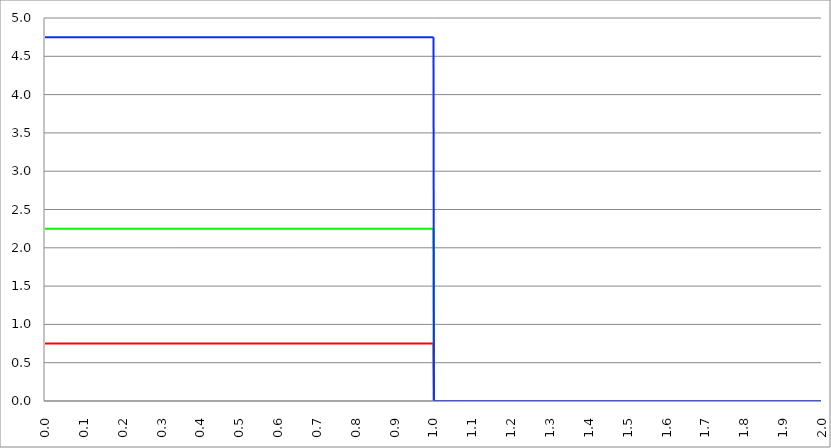
| Category | Series 1 | Series 0 | Series 2 |
|---|---|---|---|
| 0.0 | 0.75 | 2.25 | 4.75 |
| 0.001 | 0.75 | 2.25 | 4.75 |
| 0.002 | 0.75 | 2.25 | 4.75 |
| 0.003 | 0.75 | 2.25 | 4.75 |
| 0.004 | 0.75 | 2.25 | 4.75 |
| 0.005 | 0.75 | 2.25 | 4.75 |
| 0.006 | 0.75 | 2.25 | 4.75 |
| 0.007 | 0.75 | 2.25 | 4.75 |
| 0.008 | 0.75 | 2.25 | 4.75 |
| 0.009 | 0.75 | 2.25 | 4.75 |
| 0.01 | 0.75 | 2.25 | 4.75 |
| 0.011 | 0.75 | 2.25 | 4.75 |
| 0.012 | 0.75 | 2.25 | 4.75 |
| 0.013 | 0.75 | 2.25 | 4.75 |
| 0.014 | 0.75 | 2.25 | 4.75 |
| 0.015 | 0.75 | 2.25 | 4.75 |
| 0.016 | 0.75 | 2.25 | 4.75 |
| 0.017 | 0.75 | 2.25 | 4.75 |
| 0.018 | 0.75 | 2.25 | 4.75 |
| 0.019 | 0.75 | 2.25 | 4.75 |
| 0.02 | 0.75 | 2.25 | 4.75 |
| 0.021 | 0.75 | 2.25 | 4.75 |
| 0.022 | 0.75 | 2.25 | 4.75 |
| 0.023 | 0.75 | 2.25 | 4.75 |
| 0.024 | 0.75 | 2.25 | 4.75 |
| 0.025 | 0.75 | 2.25 | 4.75 |
| 0.026 | 0.75 | 2.25 | 4.75 |
| 0.027 | 0.75 | 2.25 | 4.75 |
| 0.028 | 0.75 | 2.25 | 4.75 |
| 0.029 | 0.75 | 2.25 | 4.75 |
| 0.03 | 0.75 | 2.25 | 4.75 |
| 0.031 | 0.75 | 2.25 | 4.75 |
| 0.032 | 0.75 | 2.25 | 4.75 |
| 0.033 | 0.75 | 2.25 | 4.75 |
| 0.034 | 0.75 | 2.25 | 4.75 |
| 0.035 | 0.75 | 2.25 | 4.75 |
| 0.036 | 0.75 | 2.25 | 4.75 |
| 0.037 | 0.75 | 2.25 | 4.75 |
| 0.038 | 0.75 | 2.25 | 4.75 |
| 0.039 | 0.75 | 2.25 | 4.75 |
| 0.04 | 0.75 | 2.25 | 4.75 |
| 0.041 | 0.75 | 2.25 | 4.75 |
| 0.042 | 0.75 | 2.25 | 4.75 |
| 0.043 | 0.75 | 2.25 | 4.75 |
| 0.044 | 0.75 | 2.25 | 4.75 |
| 0.045 | 0.75 | 2.25 | 4.75 |
| 0.046 | 0.75 | 2.25 | 4.75 |
| 0.047 | 0.75 | 2.25 | 4.75 |
| 0.048 | 0.75 | 2.25 | 4.75 |
| 0.049 | 0.75 | 2.25 | 4.75 |
| 0.05 | 0.75 | 2.25 | 4.75 |
| 0.051 | 0.75 | 2.25 | 4.75 |
| 0.052 | 0.75 | 2.25 | 4.75 |
| 0.053 | 0.75 | 2.25 | 4.75 |
| 0.054 | 0.75 | 2.25 | 4.75 |
| 0.055 | 0.75 | 2.25 | 4.75 |
| 0.056 | 0.75 | 2.25 | 4.75 |
| 0.057 | 0.75 | 2.25 | 4.75 |
| 0.058 | 0.75 | 2.25 | 4.75 |
| 0.059 | 0.75 | 2.25 | 4.75 |
| 0.06 | 0.75 | 2.25 | 4.75 |
| 0.061 | 0.75 | 2.25 | 4.75 |
| 0.062 | 0.75 | 2.25 | 4.75 |
| 0.063 | 0.75 | 2.25 | 4.75 |
| 0.064 | 0.75 | 2.25 | 4.75 |
| 0.065 | 0.75 | 2.25 | 4.75 |
| 0.066 | 0.75 | 2.25 | 4.75 |
| 0.067 | 0.75 | 2.25 | 4.75 |
| 0.068 | 0.75 | 2.25 | 4.75 |
| 0.069 | 0.75 | 2.25 | 4.75 |
| 0.07 | 0.75 | 2.25 | 4.75 |
| 0.071 | 0.75 | 2.25 | 4.75 |
| 0.072 | 0.75 | 2.25 | 4.75 |
| 0.073 | 0.75 | 2.25 | 4.75 |
| 0.074 | 0.75 | 2.25 | 4.75 |
| 0.075 | 0.75 | 2.25 | 4.75 |
| 0.076 | 0.75 | 2.25 | 4.75 |
| 0.077 | 0.75 | 2.25 | 4.75 |
| 0.078 | 0.75 | 2.25 | 4.75 |
| 0.079 | 0.75 | 2.25 | 4.75 |
| 0.08 | 0.75 | 2.25 | 4.75 |
| 0.081 | 0.75 | 2.25 | 4.75 |
| 0.082 | 0.75 | 2.25 | 4.75 |
| 0.083 | 0.75 | 2.25 | 4.75 |
| 0.084 | 0.75 | 2.25 | 4.75 |
| 0.085 | 0.75 | 2.25 | 4.75 |
| 0.086 | 0.75 | 2.25 | 4.75 |
| 0.087 | 0.75 | 2.25 | 4.75 |
| 0.088 | 0.75 | 2.25 | 4.75 |
| 0.089 | 0.75 | 2.25 | 4.75 |
| 0.09 | 0.75 | 2.25 | 4.75 |
| 0.091 | 0.75 | 2.25 | 4.75 |
| 0.092 | 0.75 | 2.25 | 4.75 |
| 0.093 | 0.75 | 2.25 | 4.75 |
| 0.094 | 0.75 | 2.25 | 4.75 |
| 0.095 | 0.75 | 2.25 | 4.75 |
| 0.096 | 0.75 | 2.25 | 4.75 |
| 0.097 | 0.75 | 2.25 | 4.75 |
| 0.098 | 0.75 | 2.25 | 4.75 |
| 0.099 | 0.75 | 2.25 | 4.75 |
| 0.1 | 0.75 | 2.25 | 4.75 |
| 0.101 | 0.75 | 2.25 | 4.75 |
| 0.102 | 0.75 | 2.25 | 4.75 |
| 0.103 | 0.75 | 2.25 | 4.75 |
| 0.104 | 0.75 | 2.25 | 4.75 |
| 0.105 | 0.75 | 2.25 | 4.75 |
| 0.106 | 0.75 | 2.25 | 4.75 |
| 0.107 | 0.75 | 2.25 | 4.75 |
| 0.108 | 0.75 | 2.25 | 4.75 |
| 0.109 | 0.75 | 2.25 | 4.75 |
| 0.11 | 0.75 | 2.25 | 4.75 |
| 0.111 | 0.75 | 2.25 | 4.75 |
| 0.112 | 0.75 | 2.25 | 4.75 |
| 0.113 | 0.75 | 2.25 | 4.75 |
| 0.114 | 0.75 | 2.25 | 4.75 |
| 0.115 | 0.75 | 2.25 | 4.75 |
| 0.116 | 0.75 | 2.25 | 4.75 |
| 0.117 | 0.75 | 2.25 | 4.75 |
| 0.118 | 0.75 | 2.25 | 4.75 |
| 0.119 | 0.75 | 2.25 | 4.75 |
| 0.12 | 0.75 | 2.25 | 4.75 |
| 0.121 | 0.75 | 2.25 | 4.75 |
| 0.122 | 0.75 | 2.25 | 4.75 |
| 0.123 | 0.75 | 2.25 | 4.75 |
| 0.124 | 0.75 | 2.25 | 4.75 |
| 0.125 | 0.75 | 2.25 | 4.75 |
| 0.126 | 0.75 | 2.25 | 4.75 |
| 0.127 | 0.75 | 2.25 | 4.75 |
| 0.128 | 0.75 | 2.25 | 4.75 |
| 0.129 | 0.75 | 2.25 | 4.75 |
| 0.13 | 0.75 | 2.25 | 4.75 |
| 0.131 | 0.75 | 2.25 | 4.75 |
| 0.132 | 0.75 | 2.25 | 4.75 |
| 0.133 | 0.75 | 2.25 | 4.75 |
| 0.134 | 0.75 | 2.25 | 4.75 |
| 0.135 | 0.75 | 2.25 | 4.75 |
| 0.136 | 0.75 | 2.25 | 4.75 |
| 0.137 | 0.75 | 2.25 | 4.75 |
| 0.138 | 0.75 | 2.25 | 4.75 |
| 0.139 | 0.75 | 2.25 | 4.75 |
| 0.14 | 0.75 | 2.25 | 4.75 |
| 0.141 | 0.75 | 2.25 | 4.75 |
| 0.142 | 0.75 | 2.25 | 4.75 |
| 0.143 | 0.75 | 2.25 | 4.75 |
| 0.144 | 0.75 | 2.25 | 4.75 |
| 0.145 | 0.75 | 2.25 | 4.75 |
| 0.146 | 0.75 | 2.25 | 4.75 |
| 0.147 | 0.75 | 2.25 | 4.75 |
| 0.148 | 0.75 | 2.25 | 4.75 |
| 0.149 | 0.75 | 2.25 | 4.75 |
| 0.15 | 0.75 | 2.25 | 4.75 |
| 0.151 | 0.75 | 2.25 | 4.75 |
| 0.152 | 0.75 | 2.25 | 4.75 |
| 0.153 | 0.75 | 2.25 | 4.75 |
| 0.154 | 0.75 | 2.25 | 4.75 |
| 0.155 | 0.75 | 2.25 | 4.75 |
| 0.156 | 0.75 | 2.25 | 4.75 |
| 0.157 | 0.75 | 2.25 | 4.75 |
| 0.158 | 0.75 | 2.25 | 4.75 |
| 0.159 | 0.75 | 2.25 | 4.75 |
| 0.16 | 0.75 | 2.25 | 4.75 |
| 0.161 | 0.75 | 2.25 | 4.75 |
| 0.162 | 0.75 | 2.25 | 4.75 |
| 0.163 | 0.75 | 2.25 | 4.75 |
| 0.164 | 0.75 | 2.25 | 4.75 |
| 0.165 | 0.75 | 2.25 | 4.75 |
| 0.166 | 0.75 | 2.25 | 4.75 |
| 0.167 | 0.75 | 2.25 | 4.75 |
| 0.168 | 0.75 | 2.25 | 4.75 |
| 0.169 | 0.75 | 2.25 | 4.75 |
| 0.17 | 0.75 | 2.25 | 4.75 |
| 0.171 | 0.75 | 2.25 | 4.75 |
| 0.172 | 0.75 | 2.25 | 4.75 |
| 0.173 | 0.75 | 2.25 | 4.75 |
| 0.174 | 0.75 | 2.25 | 4.75 |
| 0.175 | 0.75 | 2.25 | 4.75 |
| 0.176 | 0.75 | 2.25 | 4.75 |
| 0.177 | 0.75 | 2.25 | 4.75 |
| 0.178 | 0.75 | 2.25 | 4.75 |
| 0.179 | 0.75 | 2.25 | 4.75 |
| 0.18 | 0.75 | 2.25 | 4.75 |
| 0.181 | 0.75 | 2.25 | 4.75 |
| 0.182 | 0.75 | 2.25 | 4.75 |
| 0.183 | 0.75 | 2.25 | 4.75 |
| 0.184 | 0.75 | 2.25 | 4.75 |
| 0.185 | 0.75 | 2.25 | 4.75 |
| 0.186 | 0.75 | 2.25 | 4.75 |
| 0.187 | 0.75 | 2.25 | 4.75 |
| 0.188 | 0.75 | 2.25 | 4.75 |
| 0.189 | 0.75 | 2.25 | 4.75 |
| 0.19 | 0.75 | 2.25 | 4.75 |
| 0.191 | 0.75 | 2.25 | 4.75 |
| 0.192 | 0.75 | 2.25 | 4.75 |
| 0.193 | 0.75 | 2.25 | 4.75 |
| 0.194 | 0.75 | 2.25 | 4.75 |
| 0.195 | 0.75 | 2.25 | 4.75 |
| 0.196 | 0.75 | 2.25 | 4.75 |
| 0.197 | 0.75 | 2.25 | 4.75 |
| 0.198 | 0.75 | 2.25 | 4.75 |
| 0.199 | 0.75 | 2.25 | 4.75 |
| 0.2 | 0.75 | 2.25 | 4.75 |
| 0.201 | 0.75 | 2.25 | 4.75 |
| 0.202 | 0.75 | 2.25 | 4.75 |
| 0.203 | 0.75 | 2.25 | 4.75 |
| 0.204 | 0.75 | 2.25 | 4.75 |
| 0.205 | 0.75 | 2.25 | 4.75 |
| 0.206 | 0.75 | 2.25 | 4.75 |
| 0.207 | 0.75 | 2.25 | 4.75 |
| 0.208 | 0.75 | 2.25 | 4.75 |
| 0.209 | 0.75 | 2.25 | 4.75 |
| 0.21 | 0.75 | 2.25 | 4.75 |
| 0.211 | 0.75 | 2.25 | 4.75 |
| 0.212 | 0.75 | 2.25 | 4.75 |
| 0.213 | 0.75 | 2.25 | 4.75 |
| 0.214 | 0.75 | 2.25 | 4.75 |
| 0.215 | 0.75 | 2.25 | 4.75 |
| 0.216 | 0.75 | 2.25 | 4.75 |
| 0.217 | 0.75 | 2.25 | 4.75 |
| 0.218 | 0.75 | 2.25 | 4.75 |
| 0.219 | 0.75 | 2.25 | 4.75 |
| 0.22 | 0.75 | 2.25 | 4.75 |
| 0.221 | 0.75 | 2.25 | 4.75 |
| 0.222 | 0.75 | 2.25 | 4.75 |
| 0.223 | 0.75 | 2.25 | 4.75 |
| 0.224 | 0.75 | 2.25 | 4.75 |
| 0.225 | 0.75 | 2.25 | 4.75 |
| 0.226 | 0.75 | 2.25 | 4.75 |
| 0.227 | 0.75 | 2.25 | 4.75 |
| 0.228 | 0.75 | 2.25 | 4.75 |
| 0.229 | 0.75 | 2.25 | 4.75 |
| 0.23 | 0.75 | 2.25 | 4.75 |
| 0.231 | 0.75 | 2.25 | 4.75 |
| 0.232 | 0.75 | 2.25 | 4.75 |
| 0.233 | 0.75 | 2.25 | 4.75 |
| 0.234 | 0.75 | 2.25 | 4.75 |
| 0.235 | 0.75 | 2.25 | 4.75 |
| 0.236 | 0.75 | 2.25 | 4.75 |
| 0.237 | 0.75 | 2.25 | 4.75 |
| 0.238 | 0.75 | 2.25 | 4.75 |
| 0.239 | 0.75 | 2.25 | 4.75 |
| 0.24 | 0.75 | 2.25 | 4.75 |
| 0.241 | 0.75 | 2.25 | 4.75 |
| 0.242 | 0.75 | 2.25 | 4.75 |
| 0.243 | 0.75 | 2.25 | 4.75 |
| 0.244 | 0.75 | 2.25 | 4.75 |
| 0.245 | 0.75 | 2.25 | 4.75 |
| 0.246 | 0.75 | 2.25 | 4.75 |
| 0.247 | 0.75 | 2.25 | 4.75 |
| 0.248 | 0.75 | 2.25 | 4.75 |
| 0.249 | 0.75 | 2.25 | 4.75 |
| 0.25 | 0.75 | 2.25 | 4.75 |
| 0.251 | 0.75 | 2.25 | 4.75 |
| 0.252 | 0.75 | 2.25 | 4.75 |
| 0.253 | 0.75 | 2.25 | 4.75 |
| 0.254 | 0.75 | 2.25 | 4.75 |
| 0.255 | 0.75 | 2.25 | 4.75 |
| 0.256 | 0.75 | 2.25 | 4.75 |
| 0.257 | 0.75 | 2.25 | 4.75 |
| 0.258 | 0.75 | 2.25 | 4.75 |
| 0.259 | 0.75 | 2.25 | 4.75 |
| 0.26 | 0.75 | 2.25 | 4.75 |
| 0.261 | 0.75 | 2.25 | 4.75 |
| 0.262 | 0.75 | 2.25 | 4.75 |
| 0.263 | 0.75 | 2.25 | 4.75 |
| 0.264 | 0.75 | 2.25 | 4.75 |
| 0.265 | 0.75 | 2.25 | 4.75 |
| 0.266 | 0.75 | 2.25 | 4.75 |
| 0.267 | 0.75 | 2.25 | 4.75 |
| 0.268 | 0.75 | 2.25 | 4.75 |
| 0.269 | 0.75 | 2.25 | 4.75 |
| 0.27 | 0.75 | 2.25 | 4.75 |
| 0.271 | 0.75 | 2.25 | 4.75 |
| 0.272 | 0.75 | 2.25 | 4.75 |
| 0.273 | 0.75 | 2.25 | 4.75 |
| 0.274 | 0.75 | 2.25 | 4.75 |
| 0.275 | 0.75 | 2.25 | 4.75 |
| 0.276 | 0.75 | 2.25 | 4.75 |
| 0.277 | 0.75 | 2.25 | 4.75 |
| 0.278 | 0.75 | 2.25 | 4.75 |
| 0.279 | 0.75 | 2.25 | 4.75 |
| 0.28 | 0.75 | 2.25 | 4.75 |
| 0.281 | 0.75 | 2.25 | 4.75 |
| 0.282 | 0.75 | 2.25 | 4.75 |
| 0.283 | 0.75 | 2.25 | 4.75 |
| 0.284 | 0.75 | 2.25 | 4.75 |
| 0.285 | 0.75 | 2.25 | 4.75 |
| 0.286 | 0.75 | 2.25 | 4.75 |
| 0.287 | 0.75 | 2.25 | 4.75 |
| 0.288 | 0.75 | 2.25 | 4.75 |
| 0.289 | 0.75 | 2.25 | 4.75 |
| 0.29 | 0.75 | 2.25 | 4.75 |
| 0.291 | 0.75 | 2.25 | 4.75 |
| 0.292 | 0.75 | 2.25 | 4.75 |
| 0.293 | 0.75 | 2.25 | 4.75 |
| 0.294 | 0.75 | 2.25 | 4.75 |
| 0.295 | 0.75 | 2.25 | 4.75 |
| 0.296 | 0.75 | 2.25 | 4.75 |
| 0.297 | 0.75 | 2.25 | 4.75 |
| 0.298 | 0.75 | 2.25 | 4.75 |
| 0.299 | 0.75 | 2.25 | 4.75 |
| 0.3 | 0.75 | 2.25 | 4.75 |
| 0.301 | 0.75 | 2.25 | 4.75 |
| 0.302 | 0.75 | 2.25 | 4.75 |
| 0.303 | 0.75 | 2.25 | 4.75 |
| 0.304 | 0.75 | 2.25 | 4.75 |
| 0.305 | 0.75 | 2.25 | 4.75 |
| 0.306 | 0.75 | 2.25 | 4.75 |
| 0.307 | 0.75 | 2.25 | 4.75 |
| 0.308 | 0.75 | 2.25 | 4.75 |
| 0.309 | 0.75 | 2.25 | 4.75 |
| 0.31 | 0.75 | 2.25 | 4.75 |
| 0.311 | 0.75 | 2.25 | 4.75 |
| 0.312 | 0.75 | 2.25 | 4.75 |
| 0.313 | 0.75 | 2.25 | 4.75 |
| 0.314 | 0.75 | 2.25 | 4.75 |
| 0.315 | 0.75 | 2.25 | 4.75 |
| 0.316 | 0.75 | 2.25 | 4.75 |
| 0.317 | 0.75 | 2.25 | 4.75 |
| 0.318 | 0.75 | 2.25 | 4.75 |
| 0.319 | 0.75 | 2.25 | 4.75 |
| 0.32 | 0.75 | 2.25 | 4.75 |
| 0.321 | 0.75 | 2.25 | 4.75 |
| 0.322 | 0.75 | 2.25 | 4.75 |
| 0.323 | 0.75 | 2.25 | 4.75 |
| 0.324 | 0.75 | 2.25 | 4.75 |
| 0.325 | 0.75 | 2.25 | 4.75 |
| 0.326 | 0.75 | 2.25 | 4.75 |
| 0.327 | 0.75 | 2.25 | 4.75 |
| 0.328 | 0.75 | 2.25 | 4.75 |
| 0.329 | 0.75 | 2.25 | 4.75 |
| 0.33 | 0.75 | 2.25 | 4.75 |
| 0.331 | 0.75 | 2.25 | 4.75 |
| 0.332 | 0.75 | 2.25 | 4.75 |
| 0.333 | 0.75 | 2.25 | 4.75 |
| 0.334 | 0.75 | 2.25 | 4.75 |
| 0.335 | 0.75 | 2.25 | 4.75 |
| 0.336 | 0.75 | 2.25 | 4.75 |
| 0.337 | 0.75 | 2.25 | 4.75 |
| 0.338 | 0.75 | 2.25 | 4.75 |
| 0.339 | 0.75 | 2.25 | 4.75 |
| 0.34 | 0.75 | 2.25 | 4.75 |
| 0.341 | 0.75 | 2.25 | 4.75 |
| 0.342 | 0.75 | 2.25 | 4.75 |
| 0.343 | 0.75 | 2.25 | 4.75 |
| 0.344 | 0.75 | 2.25 | 4.75 |
| 0.345 | 0.75 | 2.25 | 4.75 |
| 0.346 | 0.75 | 2.25 | 4.75 |
| 0.347 | 0.75 | 2.25 | 4.75 |
| 0.348 | 0.75 | 2.25 | 4.75 |
| 0.349 | 0.75 | 2.25 | 4.75 |
| 0.35 | 0.75 | 2.25 | 4.75 |
| 0.351 | 0.75 | 2.25 | 4.75 |
| 0.352 | 0.75 | 2.25 | 4.75 |
| 0.353 | 0.75 | 2.25 | 4.75 |
| 0.354 | 0.75 | 2.25 | 4.75 |
| 0.355 | 0.75 | 2.25 | 4.75 |
| 0.356 | 0.75 | 2.25 | 4.75 |
| 0.357 | 0.75 | 2.25 | 4.75 |
| 0.358 | 0.75 | 2.25 | 4.75 |
| 0.359 | 0.75 | 2.25 | 4.75 |
| 0.36 | 0.75 | 2.25 | 4.75 |
| 0.361 | 0.75 | 2.25 | 4.75 |
| 0.362 | 0.75 | 2.25 | 4.75 |
| 0.363 | 0.75 | 2.25 | 4.75 |
| 0.364 | 0.75 | 2.25 | 4.75 |
| 0.365 | 0.75 | 2.25 | 4.75 |
| 0.366 | 0.75 | 2.25 | 4.75 |
| 0.367 | 0.75 | 2.25 | 4.75 |
| 0.368 | 0.75 | 2.25 | 4.75 |
| 0.369 | 0.75 | 2.25 | 4.75 |
| 0.37 | 0.75 | 2.25 | 4.75 |
| 0.371 | 0.75 | 2.25 | 4.75 |
| 0.372 | 0.75 | 2.25 | 4.75 |
| 0.373 | 0.75 | 2.25 | 4.75 |
| 0.374 | 0.75 | 2.25 | 4.75 |
| 0.375 | 0.75 | 2.25 | 4.75 |
| 0.376 | 0.75 | 2.25 | 4.75 |
| 0.377 | 0.75 | 2.25 | 4.75 |
| 0.378 | 0.75 | 2.25 | 4.75 |
| 0.379 | 0.75 | 2.25 | 4.75 |
| 0.38 | 0.75 | 2.25 | 4.75 |
| 0.381 | 0.75 | 2.25 | 4.75 |
| 0.382 | 0.75 | 2.25 | 4.75 |
| 0.383 | 0.75 | 2.25 | 4.75 |
| 0.384 | 0.75 | 2.25 | 4.75 |
| 0.385 | 0.75 | 2.25 | 4.75 |
| 0.386 | 0.75 | 2.25 | 4.75 |
| 0.387 | 0.75 | 2.25 | 4.75 |
| 0.388 | 0.75 | 2.25 | 4.75 |
| 0.389 | 0.75 | 2.25 | 4.75 |
| 0.39 | 0.75 | 2.25 | 4.75 |
| 0.391 | 0.75 | 2.25 | 4.75 |
| 0.392 | 0.75 | 2.25 | 4.75 |
| 0.393 | 0.75 | 2.25 | 4.75 |
| 0.394 | 0.75 | 2.25 | 4.75 |
| 0.395 | 0.75 | 2.25 | 4.75 |
| 0.396 | 0.75 | 2.25 | 4.75 |
| 0.397 | 0.75 | 2.25 | 4.75 |
| 0.398 | 0.75 | 2.25 | 4.75 |
| 0.399 | 0.75 | 2.25 | 4.75 |
| 0.4 | 0.75 | 2.25 | 4.75 |
| 0.401 | 0.75 | 2.25 | 4.75 |
| 0.402 | 0.75 | 2.25 | 4.75 |
| 0.403 | 0.75 | 2.25 | 4.75 |
| 0.404 | 0.75 | 2.25 | 4.75 |
| 0.405 | 0.75 | 2.25 | 4.75 |
| 0.406 | 0.75 | 2.25 | 4.75 |
| 0.407 | 0.75 | 2.25 | 4.75 |
| 0.408 | 0.75 | 2.25 | 4.75 |
| 0.409 | 0.75 | 2.25 | 4.75 |
| 0.41 | 0.75 | 2.25 | 4.75 |
| 0.411 | 0.75 | 2.25 | 4.75 |
| 0.412 | 0.75 | 2.25 | 4.75 |
| 0.413 | 0.75 | 2.25 | 4.75 |
| 0.414 | 0.75 | 2.25 | 4.75 |
| 0.415 | 0.75 | 2.25 | 4.75 |
| 0.416 | 0.75 | 2.25 | 4.75 |
| 0.417 | 0.75 | 2.25 | 4.75 |
| 0.418 | 0.75 | 2.25 | 4.75 |
| 0.419 | 0.75 | 2.25 | 4.75 |
| 0.42 | 0.75 | 2.25 | 4.75 |
| 0.421 | 0.75 | 2.25 | 4.75 |
| 0.422 | 0.75 | 2.25 | 4.75 |
| 0.423 | 0.75 | 2.25 | 4.75 |
| 0.424 | 0.75 | 2.25 | 4.75 |
| 0.425 | 0.75 | 2.25 | 4.75 |
| 0.426 | 0.75 | 2.25 | 4.75 |
| 0.427 | 0.75 | 2.25 | 4.75 |
| 0.428 | 0.75 | 2.25 | 4.75 |
| 0.429 | 0.75 | 2.25 | 4.75 |
| 0.43 | 0.75 | 2.25 | 4.75 |
| 0.431 | 0.75 | 2.25 | 4.75 |
| 0.432 | 0.75 | 2.25 | 4.75 |
| 0.433 | 0.75 | 2.25 | 4.75 |
| 0.434 | 0.75 | 2.25 | 4.75 |
| 0.435 | 0.75 | 2.25 | 4.75 |
| 0.436 | 0.75 | 2.25 | 4.75 |
| 0.437 | 0.75 | 2.25 | 4.75 |
| 0.438 | 0.75 | 2.25 | 4.75 |
| 0.439 | 0.75 | 2.25 | 4.75 |
| 0.44 | 0.75 | 2.25 | 4.75 |
| 0.441 | 0.75 | 2.25 | 4.75 |
| 0.442 | 0.75 | 2.25 | 4.75 |
| 0.443 | 0.75 | 2.25 | 4.75 |
| 0.444 | 0.75 | 2.25 | 4.75 |
| 0.445 | 0.75 | 2.25 | 4.75 |
| 0.446 | 0.75 | 2.25 | 4.75 |
| 0.447 | 0.75 | 2.25 | 4.75 |
| 0.448 | 0.75 | 2.25 | 4.75 |
| 0.449 | 0.75 | 2.25 | 4.75 |
| 0.45 | 0.75 | 2.25 | 4.75 |
| 0.451 | 0.75 | 2.25 | 4.75 |
| 0.452 | 0.75 | 2.25 | 4.75 |
| 0.453 | 0.75 | 2.25 | 4.75 |
| 0.454 | 0.75 | 2.25 | 4.75 |
| 0.455 | 0.75 | 2.25 | 4.75 |
| 0.456 | 0.75 | 2.25 | 4.75 |
| 0.457 | 0.75 | 2.25 | 4.75 |
| 0.458 | 0.75 | 2.25 | 4.75 |
| 0.459 | 0.75 | 2.25 | 4.75 |
| 0.46 | 0.75 | 2.25 | 4.75 |
| 0.461 | 0.75 | 2.25 | 4.75 |
| 0.462 | 0.75 | 2.25 | 4.75 |
| 0.463 | 0.75 | 2.25 | 4.75 |
| 0.464 | 0.75 | 2.25 | 4.75 |
| 0.465 | 0.75 | 2.25 | 4.75 |
| 0.466 | 0.75 | 2.25 | 4.75 |
| 0.467 | 0.75 | 2.25 | 4.75 |
| 0.468 | 0.75 | 2.25 | 4.75 |
| 0.469 | 0.75 | 2.25 | 4.75 |
| 0.47 | 0.75 | 2.25 | 4.75 |
| 0.471 | 0.75 | 2.25 | 4.75 |
| 0.472 | 0.75 | 2.25 | 4.75 |
| 0.473 | 0.75 | 2.25 | 4.75 |
| 0.474 | 0.75 | 2.25 | 4.75 |
| 0.475 | 0.75 | 2.25 | 4.75 |
| 0.476 | 0.75 | 2.25 | 4.75 |
| 0.477 | 0.75 | 2.25 | 4.75 |
| 0.478 | 0.75 | 2.25 | 4.75 |
| 0.479 | 0.75 | 2.25 | 4.75 |
| 0.48 | 0.75 | 2.25 | 4.75 |
| 0.481 | 0.75 | 2.25 | 4.75 |
| 0.482 | 0.75 | 2.25 | 4.75 |
| 0.483 | 0.75 | 2.25 | 4.75 |
| 0.484 | 0.75 | 2.25 | 4.75 |
| 0.485 | 0.75 | 2.25 | 4.75 |
| 0.486 | 0.75 | 2.25 | 4.75 |
| 0.487 | 0.75 | 2.25 | 4.75 |
| 0.488 | 0.75 | 2.25 | 4.75 |
| 0.489 | 0.75 | 2.25 | 4.75 |
| 0.49 | 0.75 | 2.25 | 4.75 |
| 0.491 | 0.75 | 2.25 | 4.75 |
| 0.492 | 0.75 | 2.25 | 4.75 |
| 0.493 | 0.75 | 2.25 | 4.75 |
| 0.494 | 0.75 | 2.25 | 4.75 |
| 0.495 | 0.75 | 2.25 | 4.75 |
| 0.496 | 0.75 | 2.25 | 4.75 |
| 0.497 | 0.75 | 2.25 | 4.75 |
| 0.498 | 0.75 | 2.25 | 4.75 |
| 0.499 | 0.75 | 2.25 | 4.75 |
| 0.5 | 0.75 | 2.25 | 4.75 |
| 0.501 | 0.75 | 2.25 | 4.75 |
| 0.502 | 0.75 | 2.25 | 4.75 |
| 0.503 | 0.75 | 2.25 | 4.75 |
| 0.504 | 0.75 | 2.25 | 4.75 |
| 0.505 | 0.75 | 2.25 | 4.75 |
| 0.506 | 0.75 | 2.25 | 4.75 |
| 0.507 | 0.75 | 2.25 | 4.75 |
| 0.508 | 0.75 | 2.25 | 4.75 |
| 0.509 | 0.75 | 2.25 | 4.75 |
| 0.51 | 0.75 | 2.25 | 4.75 |
| 0.511 | 0.75 | 2.25 | 4.75 |
| 0.512 | 0.75 | 2.25 | 4.75 |
| 0.513 | 0.75 | 2.25 | 4.75 |
| 0.514 | 0.75 | 2.25 | 4.75 |
| 0.515 | 0.75 | 2.25 | 4.75 |
| 0.516 | 0.75 | 2.25 | 4.75 |
| 0.517 | 0.75 | 2.25 | 4.75 |
| 0.518 | 0.75 | 2.25 | 4.75 |
| 0.519 | 0.75 | 2.25 | 4.75 |
| 0.52 | 0.75 | 2.25 | 4.75 |
| 0.521 | 0.75 | 2.25 | 4.75 |
| 0.522 | 0.75 | 2.25 | 4.75 |
| 0.523 | 0.75 | 2.25 | 4.75 |
| 0.524 | 0.75 | 2.25 | 4.75 |
| 0.525 | 0.75 | 2.25 | 4.75 |
| 0.526 | 0.75 | 2.25 | 4.75 |
| 0.527 | 0.75 | 2.25 | 4.75 |
| 0.528 | 0.75 | 2.25 | 4.75 |
| 0.529 | 0.75 | 2.25 | 4.75 |
| 0.53 | 0.75 | 2.25 | 4.75 |
| 0.531 | 0.75 | 2.25 | 4.75 |
| 0.532 | 0.75 | 2.25 | 4.75 |
| 0.533 | 0.75 | 2.25 | 4.75 |
| 0.534 | 0.75 | 2.25 | 4.75 |
| 0.535 | 0.75 | 2.25 | 4.75 |
| 0.536 | 0.75 | 2.25 | 4.75 |
| 0.537 | 0.75 | 2.25 | 4.75 |
| 0.538 | 0.75 | 2.25 | 4.75 |
| 0.539 | 0.75 | 2.25 | 4.75 |
| 0.54 | 0.75 | 2.25 | 4.75 |
| 0.541 | 0.75 | 2.25 | 4.75 |
| 0.542 | 0.75 | 2.25 | 4.75 |
| 0.543 | 0.75 | 2.25 | 4.75 |
| 0.544 | 0.75 | 2.25 | 4.75 |
| 0.545 | 0.75 | 2.25 | 4.75 |
| 0.546 | 0.75 | 2.25 | 4.75 |
| 0.547 | 0.75 | 2.25 | 4.75 |
| 0.548 | 0.75 | 2.25 | 4.75 |
| 0.549 | 0.75 | 2.25 | 4.75 |
| 0.55 | 0.75 | 2.25 | 4.75 |
| 0.551 | 0.75 | 2.25 | 4.75 |
| 0.552 | 0.75 | 2.25 | 4.75 |
| 0.553 | 0.75 | 2.25 | 4.75 |
| 0.554 | 0.75 | 2.25 | 4.75 |
| 0.555 | 0.75 | 2.25 | 4.75 |
| 0.556 | 0.75 | 2.25 | 4.75 |
| 0.557 | 0.75 | 2.25 | 4.75 |
| 0.558 | 0.75 | 2.25 | 4.75 |
| 0.559 | 0.75 | 2.25 | 4.75 |
| 0.56 | 0.75 | 2.25 | 4.75 |
| 0.561 | 0.75 | 2.25 | 4.75 |
| 0.562 | 0.75 | 2.25 | 4.75 |
| 0.563 | 0.75 | 2.25 | 4.75 |
| 0.564 | 0.75 | 2.25 | 4.75 |
| 0.565 | 0.75 | 2.25 | 4.75 |
| 0.566 | 0.75 | 2.25 | 4.75 |
| 0.567 | 0.75 | 2.25 | 4.75 |
| 0.568 | 0.75 | 2.25 | 4.75 |
| 0.569 | 0.75 | 2.25 | 4.75 |
| 0.57 | 0.75 | 2.25 | 4.75 |
| 0.571 | 0.75 | 2.25 | 4.75 |
| 0.572 | 0.75 | 2.25 | 4.75 |
| 0.573 | 0.75 | 2.25 | 4.75 |
| 0.574 | 0.75 | 2.25 | 4.75 |
| 0.575 | 0.75 | 2.25 | 4.75 |
| 0.576 | 0.75 | 2.25 | 4.75 |
| 0.577 | 0.75 | 2.25 | 4.75 |
| 0.578 | 0.75 | 2.25 | 4.75 |
| 0.579 | 0.75 | 2.25 | 4.75 |
| 0.58 | 0.75 | 2.25 | 4.75 |
| 0.581 | 0.75 | 2.25 | 4.75 |
| 0.582 | 0.75 | 2.25 | 4.75 |
| 0.583 | 0.75 | 2.25 | 4.75 |
| 0.584 | 0.75 | 2.25 | 4.75 |
| 0.585 | 0.75 | 2.25 | 4.75 |
| 0.586 | 0.75 | 2.25 | 4.75 |
| 0.587 | 0.75 | 2.25 | 4.75 |
| 0.588 | 0.75 | 2.25 | 4.75 |
| 0.589 | 0.75 | 2.25 | 4.75 |
| 0.59 | 0.75 | 2.25 | 4.75 |
| 0.591 | 0.75 | 2.25 | 4.75 |
| 0.592 | 0.75 | 2.25 | 4.75 |
| 0.593 | 0.75 | 2.25 | 4.75 |
| 0.594 | 0.75 | 2.25 | 4.75 |
| 0.595 | 0.75 | 2.25 | 4.75 |
| 0.596 | 0.75 | 2.25 | 4.75 |
| 0.597 | 0.75 | 2.25 | 4.75 |
| 0.598 | 0.75 | 2.25 | 4.75 |
| 0.599 | 0.75 | 2.25 | 4.75 |
| 0.6 | 0.75 | 2.25 | 4.75 |
| 0.601 | 0.75 | 2.25 | 4.75 |
| 0.602 | 0.75 | 2.25 | 4.75 |
| 0.603 | 0.75 | 2.25 | 4.75 |
| 0.604 | 0.75 | 2.25 | 4.75 |
| 0.605 | 0.75 | 2.25 | 4.75 |
| 0.606 | 0.75 | 2.25 | 4.75 |
| 0.607 | 0.75 | 2.25 | 4.75 |
| 0.608 | 0.75 | 2.25 | 4.75 |
| 0.609 | 0.75 | 2.25 | 4.75 |
| 0.61 | 0.75 | 2.25 | 4.75 |
| 0.611 | 0.75 | 2.25 | 4.75 |
| 0.612 | 0.75 | 2.25 | 4.75 |
| 0.613 | 0.75 | 2.25 | 4.75 |
| 0.614 | 0.75 | 2.25 | 4.75 |
| 0.615 | 0.75 | 2.25 | 4.75 |
| 0.616 | 0.75 | 2.25 | 4.75 |
| 0.617 | 0.75 | 2.25 | 4.75 |
| 0.618 | 0.75 | 2.25 | 4.75 |
| 0.619 | 0.75 | 2.25 | 4.75 |
| 0.62 | 0.75 | 2.25 | 4.75 |
| 0.621 | 0.75 | 2.25 | 4.75 |
| 0.622 | 0.75 | 2.25 | 4.75 |
| 0.623 | 0.75 | 2.25 | 4.75 |
| 0.624 | 0.75 | 2.25 | 4.75 |
| 0.625 | 0.75 | 2.25 | 4.75 |
| 0.626 | 0.75 | 2.25 | 4.75 |
| 0.627 | 0.75 | 2.25 | 4.75 |
| 0.628 | 0.75 | 2.25 | 4.75 |
| 0.629 | 0.75 | 2.25 | 4.75 |
| 0.63 | 0.75 | 2.25 | 4.75 |
| 0.631 | 0.75 | 2.25 | 4.75 |
| 0.632 | 0.75 | 2.25 | 4.75 |
| 0.633 | 0.75 | 2.25 | 4.75 |
| 0.634 | 0.75 | 2.25 | 4.75 |
| 0.635 | 0.75 | 2.25 | 4.75 |
| 0.636 | 0.75 | 2.25 | 4.75 |
| 0.637 | 0.75 | 2.25 | 4.75 |
| 0.638 | 0.75 | 2.25 | 4.75 |
| 0.639 | 0.75 | 2.25 | 4.75 |
| 0.64 | 0.75 | 2.25 | 4.75 |
| 0.641 | 0.75 | 2.25 | 4.75 |
| 0.642 | 0.75 | 2.25 | 4.75 |
| 0.643 | 0.75 | 2.25 | 4.75 |
| 0.644 | 0.75 | 2.25 | 4.75 |
| 0.645 | 0.75 | 2.25 | 4.75 |
| 0.646 | 0.75 | 2.25 | 4.75 |
| 0.647 | 0.75 | 2.25 | 4.75 |
| 0.648 | 0.75 | 2.25 | 4.75 |
| 0.649 | 0.75 | 2.25 | 4.75 |
| 0.65 | 0.75 | 2.25 | 4.75 |
| 0.651 | 0.75 | 2.25 | 4.75 |
| 0.652 | 0.75 | 2.25 | 4.75 |
| 0.653 | 0.75 | 2.25 | 4.75 |
| 0.654 | 0.75 | 2.25 | 4.75 |
| 0.655 | 0.75 | 2.25 | 4.75 |
| 0.656 | 0.75 | 2.25 | 4.75 |
| 0.657 | 0.75 | 2.25 | 4.75 |
| 0.658 | 0.75 | 2.25 | 4.75 |
| 0.659 | 0.75 | 2.25 | 4.75 |
| 0.66 | 0.75 | 2.25 | 4.75 |
| 0.661 | 0.75 | 2.25 | 4.75 |
| 0.662 | 0.75 | 2.25 | 4.75 |
| 0.663 | 0.75 | 2.25 | 4.75 |
| 0.664 | 0.75 | 2.25 | 4.75 |
| 0.665 | 0.75 | 2.25 | 4.75 |
| 0.666 | 0.75 | 2.25 | 4.75 |
| 0.667 | 0.75 | 2.25 | 4.75 |
| 0.668 | 0.75 | 2.25 | 4.75 |
| 0.669 | 0.75 | 2.25 | 4.75 |
| 0.67 | 0.75 | 2.25 | 4.75 |
| 0.671 | 0.75 | 2.25 | 4.75 |
| 0.672 | 0.75 | 2.25 | 4.75 |
| 0.673 | 0.75 | 2.25 | 4.75 |
| 0.674 | 0.75 | 2.25 | 4.75 |
| 0.675 | 0.75 | 2.25 | 4.75 |
| 0.676 | 0.75 | 2.25 | 4.75 |
| 0.677 | 0.75 | 2.25 | 4.75 |
| 0.678 | 0.75 | 2.25 | 4.75 |
| 0.679 | 0.75 | 2.25 | 4.75 |
| 0.68 | 0.75 | 2.25 | 4.75 |
| 0.681 | 0.75 | 2.25 | 4.75 |
| 0.682 | 0.75 | 2.25 | 4.75 |
| 0.683 | 0.75 | 2.25 | 4.75 |
| 0.684 | 0.75 | 2.25 | 4.75 |
| 0.685 | 0.75 | 2.25 | 4.75 |
| 0.686 | 0.75 | 2.25 | 4.75 |
| 0.687 | 0.75 | 2.25 | 4.75 |
| 0.688 | 0.75 | 2.25 | 4.75 |
| 0.689 | 0.75 | 2.25 | 4.75 |
| 0.69 | 0.75 | 2.25 | 4.75 |
| 0.691 | 0.75 | 2.25 | 4.75 |
| 0.692 | 0.75 | 2.25 | 4.75 |
| 0.693 | 0.75 | 2.25 | 4.75 |
| 0.694 | 0.75 | 2.25 | 4.75 |
| 0.695 | 0.75 | 2.25 | 4.75 |
| 0.696 | 0.75 | 2.25 | 4.75 |
| 0.697 | 0.75 | 2.25 | 4.75 |
| 0.698 | 0.75 | 2.25 | 4.75 |
| 0.699 | 0.75 | 2.25 | 4.75 |
| 0.7 | 0.75 | 2.25 | 4.75 |
| 0.701 | 0.75 | 2.25 | 4.75 |
| 0.702 | 0.75 | 2.25 | 4.75 |
| 0.703 | 0.75 | 2.25 | 4.75 |
| 0.704 | 0.75 | 2.25 | 4.75 |
| 0.705 | 0.75 | 2.25 | 4.75 |
| 0.706 | 0.75 | 2.25 | 4.75 |
| 0.707 | 0.75 | 2.25 | 4.75 |
| 0.708 | 0.75 | 2.25 | 4.75 |
| 0.709 | 0.75 | 2.25 | 4.75 |
| 0.71 | 0.75 | 2.25 | 4.75 |
| 0.711 | 0.75 | 2.25 | 4.75 |
| 0.712 | 0.75 | 2.25 | 4.75 |
| 0.713 | 0.75 | 2.25 | 4.75 |
| 0.714 | 0.75 | 2.25 | 4.75 |
| 0.715 | 0.75 | 2.25 | 4.75 |
| 0.716 | 0.75 | 2.25 | 4.75 |
| 0.717 | 0.75 | 2.25 | 4.75 |
| 0.718 | 0.75 | 2.25 | 4.75 |
| 0.719 | 0.75 | 2.25 | 4.75 |
| 0.72 | 0.75 | 2.25 | 4.75 |
| 0.721 | 0.75 | 2.25 | 4.75 |
| 0.722 | 0.75 | 2.25 | 4.75 |
| 0.723 | 0.75 | 2.25 | 4.75 |
| 0.724 | 0.75 | 2.25 | 4.75 |
| 0.725 | 0.75 | 2.25 | 4.75 |
| 0.726 | 0.75 | 2.25 | 4.75 |
| 0.727 | 0.75 | 2.25 | 4.75 |
| 0.728 | 0.75 | 2.25 | 4.75 |
| 0.729 | 0.75 | 2.25 | 4.75 |
| 0.73 | 0.75 | 2.25 | 4.75 |
| 0.731 | 0.75 | 2.25 | 4.75 |
| 0.732 | 0.75 | 2.25 | 4.75 |
| 0.733 | 0.75 | 2.25 | 4.75 |
| 0.734 | 0.75 | 2.25 | 4.75 |
| 0.735 | 0.75 | 2.25 | 4.75 |
| 0.736 | 0.75 | 2.25 | 4.75 |
| 0.737 | 0.75 | 2.25 | 4.75 |
| 0.738 | 0.75 | 2.25 | 4.75 |
| 0.739 | 0.75 | 2.25 | 4.75 |
| 0.74 | 0.75 | 2.25 | 4.75 |
| 0.741 | 0.75 | 2.25 | 4.75 |
| 0.742 | 0.75 | 2.25 | 4.75 |
| 0.743 | 0.75 | 2.25 | 4.75 |
| 0.744 | 0.75 | 2.25 | 4.75 |
| 0.745 | 0.75 | 2.25 | 4.75 |
| 0.746 | 0.75 | 2.25 | 4.75 |
| 0.747 | 0.75 | 2.25 | 4.75 |
| 0.748 | 0.75 | 2.25 | 4.75 |
| 0.749 | 0.75 | 2.25 | 4.75 |
| 0.75 | 0.75 | 2.25 | 4.75 |
| 0.751 | 0.75 | 2.25 | 4.75 |
| 0.752 | 0.75 | 2.25 | 4.75 |
| 0.753 | 0.75 | 2.25 | 4.75 |
| 0.754 | 0.75 | 2.25 | 4.75 |
| 0.755 | 0.75 | 2.25 | 4.75 |
| 0.756 | 0.75 | 2.25 | 4.75 |
| 0.757 | 0.75 | 2.25 | 4.75 |
| 0.758 | 0.75 | 2.25 | 4.75 |
| 0.759 | 0.75 | 2.25 | 4.75 |
| 0.76 | 0.75 | 2.25 | 4.75 |
| 0.761 | 0.75 | 2.25 | 4.75 |
| 0.762 | 0.75 | 2.25 | 4.75 |
| 0.763 | 0.75 | 2.25 | 4.75 |
| 0.764 | 0.75 | 2.25 | 4.75 |
| 0.765 | 0.75 | 2.25 | 4.75 |
| 0.766 | 0.75 | 2.25 | 4.75 |
| 0.767 | 0.75 | 2.25 | 4.75 |
| 0.768 | 0.75 | 2.25 | 4.75 |
| 0.769 | 0.75 | 2.25 | 4.75 |
| 0.77 | 0.75 | 2.25 | 4.75 |
| 0.771000000000001 | 0.75 | 2.25 | 4.75 |
| 0.772000000000001 | 0.75 | 2.25 | 4.75 |
| 0.773000000000001 | 0.75 | 2.25 | 4.75 |
| 0.774000000000001 | 0.75 | 2.25 | 4.75 |
| 0.775000000000001 | 0.75 | 2.25 | 4.75 |
| 0.776000000000001 | 0.75 | 2.25 | 4.75 |
| 0.777000000000001 | 0.75 | 2.25 | 4.75 |
| 0.778000000000001 | 0.75 | 2.25 | 4.75 |
| 0.779000000000001 | 0.75 | 2.25 | 4.75 |
| 0.78 | 0.75 | 2.25 | 4.75 |
| 0.781000000000001 | 0.75 | 2.25 | 4.75 |
| 0.782000000000001 | 0.75 | 2.25 | 4.75 |
| 0.783000000000001 | 0.75 | 2.25 | 4.75 |
| 0.784000000000001 | 0.75 | 2.25 | 4.75 |
| 0.785000000000001 | 0.75 | 2.25 | 4.75 |
| 0.786000000000001 | 0.75 | 2.25 | 4.75 |
| 0.787000000000001 | 0.75 | 2.25 | 4.75 |
| 0.788000000000001 | 0.75 | 2.25 | 4.75 |
| 0.789000000000001 | 0.75 | 2.25 | 4.75 |
| 0.79 | 0.75 | 2.25 | 4.75 |
| 0.791000000000001 | 0.75 | 2.25 | 4.75 |
| 0.792000000000001 | 0.75 | 2.25 | 4.75 |
| 0.793000000000001 | 0.75 | 2.25 | 4.75 |
| 0.794000000000001 | 0.75 | 2.25 | 4.75 |
| 0.795000000000001 | 0.75 | 2.25 | 4.75 |
| 0.796000000000001 | 0.75 | 2.25 | 4.75 |
| 0.797000000000001 | 0.75 | 2.25 | 4.75 |
| 0.798000000000001 | 0.75 | 2.25 | 4.75 |
| 0.799000000000001 | 0.75 | 2.25 | 4.75 |
| 0.800000000000001 | 0.75 | 2.25 | 4.75 |
| 0.801000000000001 | 0.75 | 2.25 | 4.75 |
| 0.802000000000001 | 0.75 | 2.25 | 4.75 |
| 0.803000000000001 | 0.75 | 2.25 | 4.75 |
| 0.804000000000001 | 0.75 | 2.25 | 4.75 |
| 0.805000000000001 | 0.75 | 2.25 | 4.75 |
| 0.806000000000001 | 0.75 | 2.25 | 4.75 |
| 0.807000000000001 | 0.75 | 2.25 | 4.75 |
| 0.808000000000001 | 0.75 | 2.25 | 4.75 |
| 0.809000000000001 | 0.75 | 2.25 | 4.75 |
| 0.810000000000001 | 0.75 | 2.25 | 4.75 |
| 0.811000000000001 | 0.75 | 2.25 | 4.75 |
| 0.812000000000001 | 0.75 | 2.25 | 4.75 |
| 0.813000000000001 | 0.75 | 2.25 | 4.75 |
| 0.814000000000001 | 0.75 | 2.25 | 4.75 |
| 0.815000000000001 | 0.75 | 2.25 | 4.75 |
| 0.816000000000001 | 0.75 | 2.25 | 4.75 |
| 0.817000000000001 | 0.75 | 2.25 | 4.75 |
| 0.818000000000001 | 0.75 | 2.25 | 4.75 |
| 0.819000000000001 | 0.75 | 2.25 | 4.75 |
| 0.820000000000001 | 0.75 | 2.25 | 4.75 |
| 0.821000000000001 | 0.75 | 2.25 | 4.75 |
| 0.822000000000001 | 0.75 | 2.25 | 4.75 |
| 0.823000000000001 | 0.75 | 2.25 | 4.75 |
| 0.824000000000001 | 0.75 | 2.25 | 4.75 |
| 0.825000000000001 | 0.75 | 2.25 | 4.75 |
| 0.826000000000001 | 0.75 | 2.25 | 4.75 |
| 0.827000000000001 | 0.75 | 2.25 | 4.75 |
| 0.828000000000001 | 0.75 | 2.25 | 4.75 |
| 0.829000000000001 | 0.75 | 2.25 | 4.75 |
| 0.830000000000001 | 0.75 | 2.25 | 4.75 |
| 0.831000000000001 | 0.75 | 2.25 | 4.75 |
| 0.832000000000001 | 0.75 | 2.25 | 4.75 |
| 0.833000000000001 | 0.75 | 2.25 | 4.75 |
| 0.834000000000001 | 0.75 | 2.25 | 4.75 |
| 0.835000000000001 | 0.75 | 2.25 | 4.75 |
| 0.836000000000001 | 0.75 | 2.25 | 4.75 |
| 0.837000000000001 | 0.75 | 2.25 | 4.75 |
| 0.838000000000001 | 0.75 | 2.25 | 4.75 |
| 0.839000000000001 | 0.75 | 2.25 | 4.75 |
| 0.840000000000001 | 0.75 | 2.25 | 4.75 |
| 0.841000000000001 | 0.75 | 2.25 | 4.75 |
| 0.842000000000001 | 0.75 | 2.25 | 4.75 |
| 0.843000000000001 | 0.75 | 2.25 | 4.75 |
| 0.844000000000001 | 0.75 | 2.25 | 4.75 |
| 0.845000000000001 | 0.75 | 2.25 | 4.75 |
| 0.846000000000001 | 0.75 | 2.25 | 4.75 |
| 0.847000000000001 | 0.75 | 2.25 | 4.75 |
| 0.848000000000001 | 0.75 | 2.25 | 4.75 |
| 0.849000000000001 | 0.75 | 2.25 | 4.75 |
| 0.850000000000001 | 0.75 | 2.25 | 4.75 |
| 0.851000000000001 | 0.75 | 2.25 | 4.75 |
| 0.852000000000001 | 0.75 | 2.25 | 4.75 |
| 0.853000000000001 | 0.75 | 2.25 | 4.75 |
| 0.854000000000001 | 0.75 | 2.25 | 4.75 |
| 0.855000000000001 | 0.75 | 2.25 | 4.75 |
| 0.856000000000001 | 0.75 | 2.25 | 4.75 |
| 0.857000000000001 | 0.75 | 2.25 | 4.75 |
| 0.858000000000001 | 0.75 | 2.25 | 4.75 |
| 0.859000000000001 | 0.75 | 2.25 | 4.75 |
| 0.860000000000001 | 0.75 | 2.25 | 4.75 |
| 0.861000000000001 | 0.75 | 2.25 | 4.75 |
| 0.862000000000001 | 0.75 | 2.25 | 4.75 |
| 0.863000000000001 | 0.75 | 2.25 | 4.75 |
| 0.864000000000001 | 0.75 | 2.25 | 4.75 |
| 0.865000000000001 | 0.75 | 2.25 | 4.75 |
| 0.866000000000001 | 0.75 | 2.25 | 4.75 |
| 0.867000000000001 | 0.75 | 2.25 | 4.75 |
| 0.868000000000001 | 0.75 | 2.25 | 4.75 |
| 0.869000000000001 | 0.75 | 2.25 | 4.75 |
| 0.870000000000001 | 0.75 | 2.25 | 4.75 |
| 0.871000000000001 | 0.75 | 2.25 | 4.75 |
| 0.872000000000001 | 0.75 | 2.25 | 4.75 |
| 0.873000000000001 | 0.75 | 2.25 | 4.75 |
| 0.874000000000001 | 0.75 | 2.25 | 4.75 |
| 0.875000000000001 | 0.75 | 2.25 | 4.75 |
| 0.876000000000001 | 0.75 | 2.25 | 4.75 |
| 0.877000000000001 | 0.75 | 2.25 | 4.75 |
| 0.878000000000001 | 0.75 | 2.25 | 4.75 |
| 0.879000000000001 | 0.75 | 2.25 | 4.75 |
| 0.880000000000001 | 0.75 | 2.25 | 4.75 |
| 0.881000000000001 | 0.75 | 2.25 | 4.75 |
| 0.882000000000001 | 0.75 | 2.25 | 4.75 |
| 0.883000000000001 | 0.75 | 2.25 | 4.75 |
| 0.884000000000001 | 0.75 | 2.25 | 4.75 |
| 0.885000000000001 | 0.75 | 2.25 | 4.75 |
| 0.886000000000001 | 0.75 | 2.25 | 4.75 |
| 0.887000000000001 | 0.75 | 2.25 | 4.75 |
| 0.888000000000001 | 0.75 | 2.25 | 4.75 |
| 0.889000000000001 | 0.75 | 2.25 | 4.75 |
| 0.890000000000001 | 0.75 | 2.25 | 4.75 |
| 0.891000000000001 | 0.75 | 2.25 | 4.75 |
| 0.892000000000001 | 0.75 | 2.25 | 4.75 |
| 0.893000000000001 | 0.75 | 2.25 | 4.75 |
| 0.894000000000001 | 0.75 | 2.25 | 4.75 |
| 0.895000000000001 | 0.75 | 2.25 | 4.75 |
| 0.896000000000001 | 0.75 | 2.25 | 4.75 |
| 0.897000000000001 | 0.75 | 2.25 | 4.75 |
| 0.898000000000001 | 0.75 | 2.25 | 4.75 |
| 0.899000000000001 | 0.75 | 2.25 | 4.75 |
| 0.900000000000001 | 0.75 | 2.25 | 4.75 |
| 0.901000000000001 | 0.75 | 2.25 | 4.75 |
| 0.902000000000001 | 0.75 | 2.25 | 4.75 |
| 0.903000000000001 | 0.75 | 2.25 | 4.75 |
| 0.904000000000001 | 0.75 | 2.25 | 4.75 |
| 0.905000000000001 | 0.75 | 2.25 | 4.75 |
| 0.906000000000001 | 0.75 | 2.25 | 4.75 |
| 0.907000000000001 | 0.75 | 2.25 | 4.75 |
| 0.908000000000001 | 0.75 | 2.25 | 4.75 |
| 0.909000000000001 | 0.75 | 2.25 | 4.75 |
| 0.910000000000001 | 0.75 | 2.25 | 4.75 |
| 0.911000000000001 | 0.75 | 2.25 | 4.75 |
| 0.912000000000001 | 0.75 | 2.25 | 4.75 |
| 0.913000000000001 | 0.75 | 2.25 | 4.75 |
| 0.914000000000001 | 0.75 | 2.25 | 4.75 |
| 0.915000000000001 | 0.75 | 2.25 | 4.75 |
| 0.916000000000001 | 0.75 | 2.25 | 4.75 |
| 0.917000000000001 | 0.75 | 2.25 | 4.75 |
| 0.918000000000001 | 0.75 | 2.25 | 4.75 |
| 0.919000000000001 | 0.75 | 2.25 | 4.75 |
| 0.920000000000001 | 0.75 | 2.25 | 4.75 |
| 0.921000000000001 | 0.75 | 2.25 | 4.75 |
| 0.922000000000001 | 0.75 | 2.25 | 4.75 |
| 0.923000000000001 | 0.75 | 2.25 | 4.75 |
| 0.924000000000001 | 0.75 | 2.25 | 4.75 |
| 0.925000000000001 | 0.75 | 2.25 | 4.75 |
| 0.926000000000001 | 0.75 | 2.25 | 4.75 |
| 0.927000000000001 | 0.75 | 2.25 | 4.75 |
| 0.928000000000001 | 0.75 | 2.25 | 4.75 |
| 0.929000000000001 | 0.75 | 2.25 | 4.75 |
| 0.930000000000001 | 0.75 | 2.25 | 4.75 |
| 0.931000000000001 | 0.75 | 2.25 | 4.75 |
| 0.932000000000001 | 0.75 | 2.25 | 4.75 |
| 0.933000000000001 | 0.75 | 2.25 | 4.75 |
| 0.934000000000001 | 0.75 | 2.25 | 4.75 |
| 0.935000000000001 | 0.75 | 2.25 | 4.75 |
| 0.936000000000001 | 0.75 | 2.25 | 4.75 |
| 0.937000000000001 | 0.75 | 2.25 | 4.75 |
| 0.938000000000001 | 0.75 | 2.25 | 4.75 |
| 0.939000000000001 | 0.75 | 2.25 | 4.75 |
| 0.940000000000001 | 0.75 | 2.25 | 4.75 |
| 0.941000000000001 | 0.75 | 2.25 | 4.75 |
| 0.942000000000001 | 0.75 | 2.25 | 4.75 |
| 0.943000000000001 | 0.75 | 2.25 | 4.75 |
| 0.944000000000001 | 0.75 | 2.25 | 4.75 |
| 0.945000000000001 | 0.75 | 2.25 | 4.75 |
| 0.946000000000001 | 0.75 | 2.25 | 4.75 |
| 0.947000000000001 | 0.75 | 2.25 | 4.75 |
| 0.948000000000001 | 0.75 | 2.25 | 4.75 |
| 0.949000000000001 | 0.75 | 2.25 | 4.75 |
| 0.950000000000001 | 0.75 | 2.25 | 4.75 |
| 0.951000000000001 | 0.75 | 2.25 | 4.75 |
| 0.952000000000001 | 0.75 | 2.25 | 4.75 |
| 0.953000000000001 | 0.75 | 2.25 | 4.75 |
| 0.954000000000001 | 0.75 | 2.25 | 4.75 |
| 0.955000000000001 | 0.75 | 2.25 | 4.75 |
| 0.956000000000001 | 0.75 | 2.25 | 4.75 |
| 0.957000000000001 | 0.75 | 2.25 | 4.75 |
| 0.958000000000001 | 0.75 | 2.25 | 4.75 |
| 0.959000000000001 | 0.75 | 2.25 | 4.75 |
| 0.960000000000001 | 0.75 | 2.25 | 4.75 |
| 0.961000000000001 | 0.75 | 2.25 | 4.75 |
| 0.962000000000001 | 0.75 | 2.25 | 4.75 |
| 0.963000000000001 | 0.75 | 2.25 | 4.75 |
| 0.964000000000001 | 0.75 | 2.25 | 4.75 |
| 0.965000000000001 | 0.75 | 2.25 | 4.75 |
| 0.966000000000001 | 0.75 | 2.25 | 4.75 |
| 0.967000000000001 | 0.75 | 2.25 | 4.75 |
| 0.968000000000001 | 0.75 | 2.25 | 4.75 |
| 0.969000000000001 | 0.75 | 2.25 | 4.75 |
| 0.970000000000001 | 0.75 | 2.25 | 4.75 |
| 0.971000000000001 | 0.75 | 2.25 | 4.75 |
| 0.972000000000001 | 0.75 | 2.25 | 4.75 |
| 0.973000000000001 | 0.75 | 2.25 | 4.75 |
| 0.974000000000001 | 0.75 | 2.25 | 4.75 |
| 0.975000000000001 | 0.75 | 2.25 | 4.75 |
| 0.976000000000001 | 0.75 | 2.25 | 4.75 |
| 0.977000000000001 | 0.75 | 2.25 | 4.75 |
| 0.978000000000001 | 0.75 | 2.25 | 4.75 |
| 0.979000000000001 | 0.75 | 2.25 | 4.75 |
| 0.980000000000001 | 0.75 | 2.25 | 4.75 |
| 0.981000000000001 | 0.75 | 2.25 | 4.75 |
| 0.982000000000001 | 0.75 | 2.25 | 4.75 |
| 0.983000000000001 | 0.75 | 2.25 | 4.75 |
| 0.984000000000001 | 0.75 | 2.25 | 4.75 |
| 0.985000000000001 | 0.75 | 2.25 | 4.75 |
| 0.986000000000001 | 0.75 | 2.25 | 4.75 |
| 0.987000000000001 | 0.75 | 2.25 | 4.75 |
| 0.988000000000001 | 0.75 | 2.25 | 4.75 |
| 0.989000000000001 | 0.75 | 2.25 | 4.75 |
| 0.990000000000001 | 0.75 | 2.25 | 4.75 |
| 0.991000000000001 | 0.75 | 2.25 | 4.75 |
| 0.992000000000001 | 0.75 | 2.25 | 4.75 |
| 0.993000000000001 | 0.75 | 2.25 | 4.75 |
| 0.994000000000001 | 0.75 | 2.25 | 4.75 |
| 0.995000000000001 | 0.75 | 2.25 | 4.75 |
| 0.996000000000001 | 0.75 | 2.25 | 4.75 |
| 0.997000000000001 | 0.75 | 2.25 | 4.75 |
| 0.998000000000001 | 0.75 | 2.25 | 4.75 |
| 0.999000000000001 | 0.75 | 2.25 | 4.75 |
| 1.000000000000001 | 0.75 | 2.25 | 4.75 |
| 1.001000000000001 | 0 | 0 | 0 |
| 1.002 | 0 | 0 | 0 |
| 1.003 | 0 | 0 | 0 |
| 1.004 | 0 | 0 | 0 |
| 1.005 | 0 | 0 | 0 |
| 1.006 | 0 | 0 | 0 |
| 1.007 | 0 | 0 | 0 |
| 1.008 | 0 | 0 | 0 |
| 1.009 | 0 | 0 | 0 |
| 1.01 | 0 | 0 | 0 |
| 1.010999999999999 | 0 | 0 | 0 |
| 1.011999999999999 | 0 | 0 | 0 |
| 1.012999999999999 | 0 | 0 | 0 |
| 1.013999999999999 | 0 | 0 | 0 |
| 1.014999999999999 | 0 | 0 | 0 |
| 1.015999999999999 | 0 | 0 | 0 |
| 1.016999999999999 | 0 | 0 | 0 |
| 1.017999999999999 | 0 | 0 | 0 |
| 1.018999999999999 | 0 | 0 | 0 |
| 1.019999999999998 | 0 | 0 | 0 |
| 1.020999999999998 | 0 | 0 | 0 |
| 1.021999999999998 | 0 | 0 | 0 |
| 1.022999999999998 | 0 | 0 | 0 |
| 1.023999999999998 | 0 | 0 | 0 |
| 1.024999999999998 | 0 | 0 | 0 |
| 1.025999999999998 | 0 | 0 | 0 |
| 1.026999999999998 | 0 | 0 | 0 |
| 1.027999999999998 | 0 | 0 | 0 |
| 1.028999999999997 | 0 | 0 | 0 |
| 1.029999999999997 | 0 | 0 | 0 |
| 1.030999999999997 | 0 | 0 | 0 |
| 1.031999999999997 | 0 | 0 | 0 |
| 1.032999999999997 | 0 | 0 | 0 |
| 1.033999999999997 | 0 | 0 | 0 |
| 1.034999999999997 | 0 | 0 | 0 |
| 1.035999999999997 | 0 | 0 | 0 |
| 1.036999999999997 | 0 | 0 | 0 |
| 1.037999999999996 | 0 | 0 | 0 |
| 1.038999999999996 | 0 | 0 | 0 |
| 1.039999999999996 | 0 | 0 | 0 |
| 1.040999999999996 | 0 | 0 | 0 |
| 1.041999999999996 | 0 | 0 | 0 |
| 1.042999999999996 | 0 | 0 | 0 |
| 1.043999999999996 | 0 | 0 | 0 |
| 1.044999999999996 | 0 | 0 | 0 |
| 1.045999999999996 | 0 | 0 | 0 |
| 1.046999999999995 | 0 | 0 | 0 |
| 1.047999999999995 | 0 | 0 | 0 |
| 1.048999999999995 | 0 | 0 | 0 |
| 1.049999999999995 | 0 | 0 | 0 |
| 1.050999999999995 | 0 | 0 | 0 |
| 1.051999999999995 | 0 | 0 | 0 |
| 1.052999999999995 | 0 | 0 | 0 |
| 1.053999999999995 | 0 | 0 | 0 |
| 1.054999999999995 | 0 | 0 | 0 |
| 1.055999999999994 | 0 | 0 | 0 |
| 1.056999999999994 | 0 | 0 | 0 |
| 1.057999999999994 | 0 | 0 | 0 |
| 1.058999999999994 | 0 | 0 | 0 |
| 1.059999999999994 | 0 | 0 | 0 |
| 1.060999999999994 | 0 | 0 | 0 |
| 1.061999999999994 | 0 | 0 | 0 |
| 1.062999999999994 | 0 | 0 | 0 |
| 1.063999999999994 | 0 | 0 | 0 |
| 1.064999999999993 | 0 | 0 | 0 |
| 1.065999999999993 | 0 | 0 | 0 |
| 1.066999999999993 | 0 | 0 | 0 |
| 1.067999999999993 | 0 | 0 | 0 |
| 1.068999999999993 | 0 | 0 | 0 |
| 1.069999999999993 | 0 | 0 | 0 |
| 1.070999999999993 | 0 | 0 | 0 |
| 1.071999999999993 | 0 | 0 | 0 |
| 1.072999999999993 | 0 | 0 | 0 |
| 1.073999999999993 | 0 | 0 | 0 |
| 1.074999999999992 | 0 | 0 | 0 |
| 1.075999999999992 | 0 | 0 | 0 |
| 1.076999999999992 | 0 | 0 | 0 |
| 1.077999999999992 | 0 | 0 | 0 |
| 1.078999999999992 | 0 | 0 | 0 |
| 1.079999999999992 | 0 | 0 | 0 |
| 1.080999999999992 | 0 | 0 | 0 |
| 1.081999999999992 | 0 | 0 | 0 |
| 1.082999999999992 | 0 | 0 | 0 |
| 1.083999999999991 | 0 | 0 | 0 |
| 1.084999999999991 | 0 | 0 | 0 |
| 1.085999999999991 | 0 | 0 | 0 |
| 1.086999999999991 | 0 | 0 | 0 |
| 1.087999999999991 | 0 | 0 | 0 |
| 1.088999999999991 | 0 | 0 | 0 |
| 1.089999999999991 | 0 | 0 | 0 |
| 1.090999999999991 | 0 | 0 | 0 |
| 1.091999999999991 | 0 | 0 | 0 |
| 1.09299999999999 | 0 | 0 | 0 |
| 1.09399999999999 | 0 | 0 | 0 |
| 1.09499999999999 | 0 | 0 | 0 |
| 1.09599999999999 | 0 | 0 | 0 |
| 1.09699999999999 | 0 | 0 | 0 |
| 1.09799999999999 | 0 | 0 | 0 |
| 1.09899999999999 | 0 | 0 | 0 |
| 1.09999999999999 | 0 | 0 | 0 |
| 1.10099999999999 | 0 | 0 | 0 |
| 1.101999999999989 | 0 | 0 | 0 |
| 1.102999999999989 | 0 | 0 | 0 |
| 1.103999999999989 | 0 | 0 | 0 |
| 1.104999999999989 | 0 | 0 | 0 |
| 1.105999999999989 | 0 | 0 | 0 |
| 1.106999999999989 | 0 | 0 | 0 |
| 1.107999999999989 | 0 | 0 | 0 |
| 1.108999999999989 | 0 | 0 | 0 |
| 1.109999999999989 | 0 | 0 | 0 |
| 1.110999999999988 | 0 | 0 | 0 |
| 1.111999999999988 | 0 | 0 | 0 |
| 1.112999999999988 | 0 | 0 | 0 |
| 1.113999999999988 | 0 | 0 | 0 |
| 1.114999999999988 | 0 | 0 | 0 |
| 1.115999999999988 | 0 | 0 | 0 |
| 1.116999999999988 | 0 | 0 | 0 |
| 1.117999999999988 | 0 | 0 | 0 |
| 1.118999999999988 | 0 | 0 | 0 |
| 1.119999999999987 | 0 | 0 | 0 |
| 1.120999999999987 | 0 | 0 | 0 |
| 1.121999999999987 | 0 | 0 | 0 |
| 1.122999999999987 | 0 | 0 | 0 |
| 1.123999999999987 | 0 | 0 | 0 |
| 1.124999999999987 | 0 | 0 | 0 |
| 1.125999999999987 | 0 | 0 | 0 |
| 1.126999999999987 | 0 | 0 | 0 |
| 1.127999999999987 | 0 | 0 | 0 |
| 1.128999999999986 | 0 | 0 | 0 |
| 1.129999999999986 | 0 | 0 | 0 |
| 1.130999999999986 | 0 | 0 | 0 |
| 1.131999999999986 | 0 | 0 | 0 |
| 1.132999999999986 | 0 | 0 | 0 |
| 1.133999999999986 | 0 | 0 | 0 |
| 1.134999999999986 | 0 | 0 | 0 |
| 1.135999999999986 | 0 | 0 | 0 |
| 1.136999999999986 | 0 | 0 | 0 |
| 1.137999999999985 | 0 | 0 | 0 |
| 1.138999999999985 | 0 | 0 | 0 |
| 1.139999999999985 | 0 | 0 | 0 |
| 1.140999999999985 | 0 | 0 | 0 |
| 1.141999999999985 | 0 | 0 | 0 |
| 1.142999999999985 | 0 | 0 | 0 |
| 1.143999999999985 | 0 | 0 | 0 |
| 1.144999999999985 | 0 | 0 | 0 |
| 1.145999999999985 | 0 | 0 | 0 |
| 1.146999999999984 | 0 | 0 | 0 |
| 1.147999999999984 | 0 | 0 | 0 |
| 1.148999999999984 | 0 | 0 | 0 |
| 1.149999999999984 | 0 | 0 | 0 |
| 1.150999999999984 | 0 | 0 | 0 |
| 1.151999999999984 | 0 | 0 | 0 |
| 1.152999999999984 | 0 | 0 | 0 |
| 1.153999999999984 | 0 | 0 | 0 |
| 1.154999999999984 | 0 | 0 | 0 |
| 1.155999999999983 | 0 | 0 | 0 |
| 1.156999999999983 | 0 | 0 | 0 |
| 1.157999999999983 | 0 | 0 | 0 |
| 1.158999999999983 | 0 | 0 | 0 |
| 1.159999999999983 | 0 | 0 | 0 |
| 1.160999999999983 | 0 | 0 | 0 |
| 1.161999999999983 | 0 | 0 | 0 |
| 1.162999999999983 | 0 | 0 | 0 |
| 1.163999999999983 | 0 | 0 | 0 |
| 1.164999999999982 | 0 | 0 | 0 |
| 1.165999999999982 | 0 | 0 | 0 |
| 1.166999999999982 | 0 | 0 | 0 |
| 1.167999999999982 | 0 | 0 | 0 |
| 1.168999999999982 | 0 | 0 | 0 |
| 1.169999999999982 | 0 | 0 | 0 |
| 1.170999999999982 | 0 | 0 | 0 |
| 1.171999999999982 | 0 | 0 | 0 |
| 1.172999999999982 | 0 | 0 | 0 |
| 1.173999999999981 | 0 | 0 | 0 |
| 1.174999999999981 | 0 | 0 | 0 |
| 1.175999999999981 | 0 | 0 | 0 |
| 1.176999999999981 | 0 | 0 | 0 |
| 1.177999999999981 | 0 | 0 | 0 |
| 1.178999999999981 | 0 | 0 | 0 |
| 1.179999999999981 | 0 | 0 | 0 |
| 1.180999999999981 | 0 | 0 | 0 |
| 1.181999999999981 | 0 | 0 | 0 |
| 1.18299999999998 | 0 | 0 | 0 |
| 1.18399999999998 | 0 | 0 | 0 |
| 1.18499999999998 | 0 | 0 | 0 |
| 1.18599999999998 | 0 | 0 | 0 |
| 1.18699999999998 | 0 | 0 | 0 |
| 1.18799999999998 | 0 | 0 | 0 |
| 1.18899999999998 | 0 | 0 | 0 |
| 1.18999999999998 | 0 | 0 | 0 |
| 1.19099999999998 | 0 | 0 | 0 |
| 1.191999999999979 | 0 | 0 | 0 |
| 1.192999999999979 | 0 | 0 | 0 |
| 1.193999999999979 | 0 | 0 | 0 |
| 1.194999999999979 | 0 | 0 | 0 |
| 1.195999999999979 | 0 | 0 | 0 |
| 1.196999999999979 | 0 | 0 | 0 |
| 1.197999999999979 | 0 | 0 | 0 |
| 1.198999999999979 | 0 | 0 | 0 |
| 1.199999999999979 | 0 | 0 | 0 |
| 1.200999999999979 | 0 | 0 | 0 |
| 1.201999999999978 | 0 | 0 | 0 |
| 1.202999999999978 | 0 | 0 | 0 |
| 1.203999999999978 | 0 | 0 | 0 |
| 1.204999999999978 | 0 | 0 | 0 |
| 1.205999999999978 | 0 | 0 | 0 |
| 1.206999999999978 | 0 | 0 | 0 |
| 1.207999999999978 | 0 | 0 | 0 |
| 1.208999999999978 | 0 | 0 | 0 |
| 1.209999999999978 | 0 | 0 | 0 |
| 1.210999999999977 | 0 | 0 | 0 |
| 1.211999999999977 | 0 | 0 | 0 |
| 1.212999999999977 | 0 | 0 | 0 |
| 1.213999999999977 | 0 | 0 | 0 |
| 1.214999999999977 | 0 | 0 | 0 |
| 1.215999999999977 | 0 | 0 | 0 |
| 1.216999999999977 | 0 | 0 | 0 |
| 1.217999999999977 | 0 | 0 | 0 |
| 1.218999999999977 | 0 | 0 | 0 |
| 1.219999999999976 | 0 | 0 | 0 |
| 1.220999999999976 | 0 | 0 | 0 |
| 1.221999999999976 | 0 | 0 | 0 |
| 1.222999999999976 | 0 | 0 | 0 |
| 1.223999999999976 | 0 | 0 | 0 |
| 1.224999999999976 | 0 | 0 | 0 |
| 1.225999999999976 | 0 | 0 | 0 |
| 1.226999999999976 | 0 | 0 | 0 |
| 1.227999999999976 | 0 | 0 | 0 |
| 1.228999999999975 | 0 | 0 | 0 |
| 1.229999999999975 | 0 | 0 | 0 |
| 1.230999999999975 | 0 | 0 | 0 |
| 1.231999999999975 | 0 | 0 | 0 |
| 1.232999999999975 | 0 | 0 | 0 |
| 1.233999999999975 | 0 | 0 | 0 |
| 1.234999999999975 | 0 | 0 | 0 |
| 1.235999999999975 | 0 | 0 | 0 |
| 1.236999999999975 | 0 | 0 | 0 |
| 1.237999999999974 | 0 | 0 | 0 |
| 1.238999999999974 | 0 | 0 | 0 |
| 1.239999999999974 | 0 | 0 | 0 |
| 1.240999999999974 | 0 | 0 | 0 |
| 1.241999999999974 | 0 | 0 | 0 |
| 1.242999999999974 | 0 | 0 | 0 |
| 1.243999999999974 | 0 | 0 | 0 |
| 1.244999999999974 | 0 | 0 | 0 |
| 1.245999999999974 | 0 | 0 | 0 |
| 1.246999999999973 | 0 | 0 | 0 |
| 1.247999999999973 | 0 | 0 | 0 |
| 1.248999999999973 | 0 | 0 | 0 |
| 1.249999999999973 | 0 | 0 | 0 |
| 1.250999999999973 | 0 | 0 | 0 |
| 1.251999999999973 | 0 | 0 | 0 |
| 1.252999999999973 | 0 | 0 | 0 |
| 1.253999999999973 | 0 | 0 | 0 |
| 1.254999999999973 | 0 | 0 | 0 |
| 1.255999999999972 | 0 | 0 | 0 |
| 1.256999999999972 | 0 | 0 | 0 |
| 1.257999999999972 | 0 | 0 | 0 |
| 1.258999999999972 | 0 | 0 | 0 |
| 1.259999999999972 | 0 | 0 | 0 |
| 1.260999999999972 | 0 | 0 | 0 |
| 1.261999999999972 | 0 | 0 | 0 |
| 1.262999999999972 | 0 | 0 | 0 |
| 1.263999999999972 | 0 | 0 | 0 |
| 1.264999999999971 | 0 | 0 | 0 |
| 1.265999999999971 | 0 | 0 | 0 |
| 1.266999999999971 | 0 | 0 | 0 |
| 1.267999999999971 | 0 | 0 | 0 |
| 1.268999999999971 | 0 | 0 | 0 |
| 1.269999999999971 | 0 | 0 | 0 |
| 1.270999999999971 | 0 | 0 | 0 |
| 1.271999999999971 | 0 | 0 | 0 |
| 1.272999999999971 | 0 | 0 | 0 |
| 1.27399999999997 | 0 | 0 | 0 |
| 1.27499999999997 | 0 | 0 | 0 |
| 1.27599999999997 | 0 | 0 | 0 |
| 1.27699999999997 | 0 | 0 | 0 |
| 1.27799999999997 | 0 | 0 | 0 |
| 1.27899999999997 | 0 | 0 | 0 |
| 1.27999999999997 | 0 | 0 | 0 |
| 1.28099999999997 | 0 | 0 | 0 |
| 1.28199999999997 | 0 | 0 | 0 |
| 1.282999999999969 | 0 | 0 | 0 |
| 1.283999999999969 | 0 | 0 | 0 |
| 1.284999999999969 | 0 | 0 | 0 |
| 1.285999999999969 | 0 | 0 | 0 |
| 1.286999999999969 | 0 | 0 | 0 |
| 1.287999999999969 | 0 | 0 | 0 |
| 1.288999999999969 | 0 | 0 | 0 |
| 1.289999999999969 | 0 | 0 | 0 |
| 1.290999999999969 | 0 | 0 | 0 |
| 1.291999999999968 | 0 | 0 | 0 |
| 1.292999999999968 | 0 | 0 | 0 |
| 1.293999999999968 | 0 | 0 | 0 |
| 1.294999999999968 | 0 | 0 | 0 |
| 1.295999999999968 | 0 | 0 | 0 |
| 1.296999999999968 | 0 | 0 | 0 |
| 1.297999999999968 | 0 | 0 | 0 |
| 1.298999999999968 | 0 | 0 | 0 |
| 1.299999999999968 | 0 | 0 | 0 |
| 1.300999999999967 | 0 | 0 | 0 |
| 1.301999999999967 | 0 | 0 | 0 |
| 1.302999999999967 | 0 | 0 | 0 |
| 1.303999999999967 | 0 | 0 | 0 |
| 1.304999999999967 | 0 | 0 | 0 |
| 1.305999999999967 | 0 | 0 | 0 |
| 1.306999999999967 | 0 | 0 | 0 |
| 1.307999999999967 | 0 | 0 | 0 |
| 1.308999999999967 | 0 | 0 | 0 |
| 1.309999999999966 | 0 | 0 | 0 |
| 1.310999999999966 | 0 | 0 | 0 |
| 1.311999999999966 | 0 | 0 | 0 |
| 1.312999999999966 | 0 | 0 | 0 |
| 1.313999999999966 | 0 | 0 | 0 |
| 1.314999999999966 | 0 | 0 | 0 |
| 1.315999999999966 | 0 | 0 | 0 |
| 1.316999999999966 | 0 | 0 | 0 |
| 1.317999999999966 | 0 | 0 | 0 |
| 1.318999999999965 | 0 | 0 | 0 |
| 1.319999999999965 | 0 | 0 | 0 |
| 1.320999999999965 | 0 | 0 | 0 |
| 1.321999999999965 | 0 | 0 | 0 |
| 1.322999999999965 | 0 | 0 | 0 |
| 1.323999999999965 | 0 | 0 | 0 |
| 1.324999999999965 | 0 | 0 | 0 |
| 1.325999999999965 | 0 | 0 | 0 |
| 1.326999999999965 | 0 | 0 | 0 |
| 1.327999999999964 | 0 | 0 | 0 |
| 1.328999999999964 | 0 | 0 | 0 |
| 1.329999999999964 | 0 | 0 | 0 |
| 1.330999999999964 | 0 | 0 | 0 |
| 1.331999999999964 | 0 | 0 | 0 |
| 1.332999999999964 | 0 | 0 | 0 |
| 1.333999999999964 | 0 | 0 | 0 |
| 1.334999999999964 | 0 | 0 | 0 |
| 1.335999999999964 | 0 | 0 | 0 |
| 1.336999999999963 | 0 | 0 | 0 |
| 1.337999999999963 | 0 | 0 | 0 |
| 1.338999999999963 | 0 | 0 | 0 |
| 1.339999999999963 | 0 | 0 | 0 |
| 1.340999999999963 | 0 | 0 | 0 |
| 1.341999999999963 | 0 | 0 | 0 |
| 1.342999999999963 | 0 | 0 | 0 |
| 1.343999999999963 | 0 | 0 | 0 |
| 1.344999999999963 | 0 | 0 | 0 |
| 1.345999999999963 | 0 | 0 | 0 |
| 1.346999999999962 | 0 | 0 | 0 |
| 1.347999999999962 | 0 | 0 | 0 |
| 1.348999999999962 | 0 | 0 | 0 |
| 1.349999999999962 | 0 | 0 | 0 |
| 1.350999999999962 | 0 | 0 | 0 |
| 1.351999999999962 | 0 | 0 | 0 |
| 1.352999999999962 | 0 | 0 | 0 |
| 1.353999999999962 | 0 | 0 | 0 |
| 1.354999999999962 | 0 | 0 | 0 |
| 1.355999999999961 | 0 | 0 | 0 |
| 1.356999999999961 | 0 | 0 | 0 |
| 1.357999999999961 | 0 | 0 | 0 |
| 1.358999999999961 | 0 | 0 | 0 |
| 1.359999999999961 | 0 | 0 | 0 |
| 1.360999999999961 | 0 | 0 | 0 |
| 1.361999999999961 | 0 | 0 | 0 |
| 1.362999999999961 | 0 | 0 | 0 |
| 1.363999999999961 | 0 | 0 | 0 |
| 1.36499999999996 | 0 | 0 | 0 |
| 1.36599999999996 | 0 | 0 | 0 |
| 1.36699999999996 | 0 | 0 | 0 |
| 1.36799999999996 | 0 | 0 | 0 |
| 1.36899999999996 | 0 | 0 | 0 |
| 1.36999999999996 | 0 | 0 | 0 |
| 1.37099999999996 | 0 | 0 | 0 |
| 1.37199999999996 | 0 | 0 | 0 |
| 1.37299999999996 | 0 | 0 | 0 |
| 1.373999999999959 | 0 | 0 | 0 |
| 1.374999999999959 | 0 | 0 | 0 |
| 1.375999999999959 | 0 | 0 | 0 |
| 1.376999999999959 | 0 | 0 | 0 |
| 1.377999999999959 | 0 | 0 | 0 |
| 1.378999999999959 | 0 | 0 | 0 |
| 1.379999999999959 | 0 | 0 | 0 |
| 1.380999999999959 | 0 | 0 | 0 |
| 1.381999999999959 | 0 | 0 | 0 |
| 1.382999999999958 | 0 | 0 | 0 |
| 1.383999999999958 | 0 | 0 | 0 |
| 1.384999999999958 | 0 | 0 | 0 |
| 1.385999999999958 | 0 | 0 | 0 |
| 1.386999999999958 | 0 | 0 | 0 |
| 1.387999999999958 | 0 | 0 | 0 |
| 1.388999999999958 | 0 | 0 | 0 |
| 1.389999999999958 | 0 | 0 | 0 |
| 1.390999999999958 | 0 | 0 | 0 |
| 1.391999999999957 | 0 | 0 | 0 |
| 1.392999999999957 | 0 | 0 | 0 |
| 1.393999999999957 | 0 | 0 | 0 |
| 1.394999999999957 | 0 | 0 | 0 |
| 1.395999999999957 | 0 | 0 | 0 |
| 1.396999999999957 | 0 | 0 | 0 |
| 1.397999999999957 | 0 | 0 | 0 |
| 1.398999999999957 | 0 | 0 | 0 |
| 1.399999999999957 | 0 | 0 | 0 |
| 1.400999999999956 | 0 | 0 | 0 |
| 1.401999999999956 | 0 | 0 | 0 |
| 1.402999999999956 | 0 | 0 | 0 |
| 1.403999999999956 | 0 | 0 | 0 |
| 1.404999999999956 | 0 | 0 | 0 |
| 1.405999999999956 | 0 | 0 | 0 |
| 1.406999999999956 | 0 | 0 | 0 |
| 1.407999999999956 | 0 | 0 | 0 |
| 1.408999999999956 | 0 | 0 | 0 |
| 1.409999999999955 | 0 | 0 | 0 |
| 1.410999999999955 | 0 | 0 | 0 |
| 1.411999999999955 | 0 | 0 | 0 |
| 1.412999999999955 | 0 | 0 | 0 |
| 1.413999999999955 | 0 | 0 | 0 |
| 1.414999999999955 | 0 | 0 | 0 |
| 1.415999999999955 | 0 | 0 | 0 |
| 1.416999999999955 | 0 | 0 | 0 |
| 1.417999999999955 | 0 | 0 | 0 |
| 1.418999999999954 | 0 | 0 | 0 |
| 1.419999999999954 | 0 | 0 | 0 |
| 1.420999999999954 | 0 | 0 | 0 |
| 1.421999999999954 | 0 | 0 | 0 |
| 1.422999999999954 | 0 | 0 | 0 |
| 1.423999999999954 | 0 | 0 | 0 |
| 1.424999999999954 | 0 | 0 | 0 |
| 1.425999999999954 | 0 | 0 | 0 |
| 1.426999999999954 | 0 | 0 | 0 |
| 1.427999999999954 | 0 | 0 | 0 |
| 1.428999999999953 | 0 | 0 | 0 |
| 1.429999999999953 | 0 | 0 | 0 |
| 1.430999999999953 | 0 | 0 | 0 |
| 1.431999999999953 | 0 | 0 | 0 |
| 1.432999999999953 | 0 | 0 | 0 |
| 1.433999999999953 | 0 | 0 | 0 |
| 1.434999999999953 | 0 | 0 | 0 |
| 1.435999999999953 | 0 | 0 | 0 |
| 1.436999999999953 | 0 | 0 | 0 |
| 1.437999999999952 | 0 | 0 | 0 |
| 1.438999999999952 | 0 | 0 | 0 |
| 1.439999999999952 | 0 | 0 | 0 |
| 1.440999999999952 | 0 | 0 | 0 |
| 1.441999999999952 | 0 | 0 | 0 |
| 1.442999999999952 | 0 | 0 | 0 |
| 1.443999999999952 | 0 | 0 | 0 |
| 1.444999999999952 | 0 | 0 | 0 |
| 1.445999999999952 | 0 | 0 | 0 |
| 1.446999999999951 | 0 | 0 | 0 |
| 1.447999999999951 | 0 | 0 | 0 |
| 1.448999999999951 | 0 | 0 | 0 |
| 1.449999999999951 | 0 | 0 | 0 |
| 1.450999999999951 | 0 | 0 | 0 |
| 1.451999999999951 | 0 | 0 | 0 |
| 1.452999999999951 | 0 | 0 | 0 |
| 1.453999999999951 | 0 | 0 | 0 |
| 1.454999999999951 | 0 | 0 | 0 |
| 1.45599999999995 | 0 | 0 | 0 |
| 1.45699999999995 | 0 | 0 | 0 |
| 1.45799999999995 | 0 | 0 | 0 |
| 1.45899999999995 | 0 | 0 | 0 |
| 1.45999999999995 | 0 | 0 | 0 |
| 1.46099999999995 | 0 | 0 | 0 |
| 1.46199999999995 | 0 | 0 | 0 |
| 1.46299999999995 | 0 | 0 | 0 |
| 1.46399999999995 | 0 | 0 | 0 |
| 1.464999999999949 | 0 | 0 | 0 |
| 1.465999999999949 | 0 | 0 | 0 |
| 1.466999999999949 | 0 | 0 | 0 |
| 1.467999999999949 | 0 | 0 | 0 |
| 1.468999999999949 | 0 | 0 | 0 |
| 1.469999999999949 | 0 | 0 | 0 |
| 1.470999999999949 | 0 | 0 | 0 |
| 1.471999999999949 | 0 | 0 | 0 |
| 1.472999999999949 | 0 | 0 | 0 |
| 1.473999999999948 | 0 | 0 | 0 |
| 1.474999999999948 | 0 | 0 | 0 |
| 1.475999999999948 | 0 | 0 | 0 |
| 1.476999999999948 | 0 | 0 | 0 |
| 1.477999999999948 | 0 | 0 | 0 |
| 1.478999999999948 | 0 | 0 | 0 |
| 1.479999999999948 | 0 | 0 | 0 |
| 1.480999999999948 | 0 | 0 | 0 |
| 1.481999999999948 | 0 | 0 | 0 |
| 1.482999999999947 | 0 | 0 | 0 |
| 1.483999999999947 | 0 | 0 | 0 |
| 1.484999999999947 | 0 | 0 | 0 |
| 1.485999999999947 | 0 | 0 | 0 |
| 1.486999999999947 | 0 | 0 | 0 |
| 1.487999999999947 | 0 | 0 | 0 |
| 1.488999999999947 | 0 | 0 | 0 |
| 1.489999999999947 | 0 | 0 | 0 |
| 1.490999999999947 | 0 | 0 | 0 |
| 1.491999999999946 | 0 | 0 | 0 |
| 1.492999999999946 | 0 | 0 | 0 |
| 1.493999999999946 | 0 | 0 | 0 |
| 1.494999999999946 | 0 | 0 | 0 |
| 1.495999999999946 | 0 | 0 | 0 |
| 1.496999999999946 | 0 | 0 | 0 |
| 1.497999999999946 | 0 | 0 | 0 |
| 1.498999999999946 | 0 | 0 | 0 |
| 1.499999999999946 | 0 | 0 | 0 |
| 1.500999999999945 | 0 | 0 | 0 |
| 1.501999999999945 | 0 | 0 | 0 |
| 1.502999999999945 | 0 | 0 | 0 |
| 1.503999999999945 | 0 | 0 | 0 |
| 1.504999999999945 | 0 | 0 | 0 |
| 1.505999999999945 | 0 | 0 | 0 |
| 1.506999999999945 | 0 | 0 | 0 |
| 1.507999999999945 | 0 | 0 | 0 |
| 1.508999999999945 | 0 | 0 | 0 |
| 1.509999999999944 | 0 | 0 | 0 |
| 1.510999999999944 | 0 | 0 | 0 |
| 1.511999999999944 | 0 | 0 | 0 |
| 1.512999999999944 | 0 | 0 | 0 |
| 1.513999999999944 | 0 | 0 | 0 |
| 1.514999999999944 | 0 | 0 | 0 |
| 1.515999999999944 | 0 | 0 | 0 |
| 1.516999999999944 | 0 | 0 | 0 |
| 1.517999999999944 | 0 | 0 | 0 |
| 1.518999999999944 | 0 | 0 | 0 |
| 1.519999999999943 | 0 | 0 | 0 |
| 1.520999999999943 | 0 | 0 | 0 |
| 1.521999999999943 | 0 | 0 | 0 |
| 1.522999999999943 | 0 | 0 | 0 |
| 1.523999999999943 | 0 | 0 | 0 |
| 1.524999999999943 | 0 | 0 | 0 |
| 1.525999999999943 | 0 | 0 | 0 |
| 1.526999999999943 | 0 | 0 | 0 |
| 1.527999999999943 | 0 | 0 | 0 |
| 1.528999999999942 | 0 | 0 | 0 |
| 1.529999999999942 | 0 | 0 | 0 |
| 1.530999999999942 | 0 | 0 | 0 |
| 1.531999999999942 | 0 | 0 | 0 |
| 1.532999999999942 | 0 | 0 | 0 |
| 1.533999999999942 | 0 | 0 | 0 |
| 1.534999999999942 | 0 | 0 | 0 |
| 1.535999999999942 | 0 | 0 | 0 |
| 1.536999999999942 | 0 | 0 | 0 |
| 1.537999999999941 | 0 | 0 | 0 |
| 1.538999999999941 | 0 | 0 | 0 |
| 1.539999999999941 | 0 | 0 | 0 |
| 1.540999999999941 | 0 | 0 | 0 |
| 1.541999999999941 | 0 | 0 | 0 |
| 1.542999999999941 | 0 | 0 | 0 |
| 1.543999999999941 | 0 | 0 | 0 |
| 1.544999999999941 | 0 | 0 | 0 |
| 1.545999999999941 | 0 | 0 | 0 |
| 1.54699999999994 | 0 | 0 | 0 |
| 1.54799999999994 | 0 | 0 | 0 |
| 1.54899999999994 | 0 | 0 | 0 |
| 1.54999999999994 | 0 | 0 | 0 |
| 1.55099999999994 | 0 | 0 | 0 |
| 1.55199999999994 | 0 | 0 | 0 |
| 1.55299999999994 | 0 | 0 | 0 |
| 1.55399999999994 | 0 | 0 | 0 |
| 1.55499999999994 | 0 | 0 | 0 |
| 1.555999999999939 | 0 | 0 | 0 |
| 1.556999999999939 | 0 | 0 | 0 |
| 1.557999999999939 | 0 | 0 | 0 |
| 1.558999999999939 | 0 | 0 | 0 |
| 1.559999999999939 | 0 | 0 | 0 |
| 1.560999999999939 | 0 | 0 | 0 |
| 1.561999999999939 | 0 | 0 | 0 |
| 1.562999999999939 | 0 | 0 | 0 |
| 1.563999999999939 | 0 | 0 | 0 |
| 1.564999999999938 | 0 | 0 | 0 |
| 1.565999999999938 | 0 | 0 | 0 |
| 1.566999999999938 | 0 | 0 | 0 |
| 1.567999999999938 | 0 | 0 | 0 |
| 1.568999999999938 | 0 | 0 | 0 |
| 1.569999999999938 | 0 | 0 | 0 |
| 1.570999999999938 | 0 | 0 | 0 |
| 1.571999999999938 | 0 | 0 | 0 |
| 1.572999999999938 | 0 | 0 | 0 |
| 1.573999999999937 | 0 | 0 | 0 |
| 1.574999999999937 | 0 | 0 | 0 |
| 1.575999999999937 | 0 | 0 | 0 |
| 1.576999999999937 | 0 | 0 | 0 |
| 1.577999999999937 | 0 | 0 | 0 |
| 1.578999999999937 | 0 | 0 | 0 |
| 1.579999999999937 | 0 | 0 | 0 |
| 1.580999999999937 | 0 | 0 | 0 |
| 1.581999999999937 | 0 | 0 | 0 |
| 1.582999999999936 | 0 | 0 | 0 |
| 1.583999999999936 | 0 | 0 | 0 |
| 1.584999999999936 | 0 | 0 | 0 |
| 1.585999999999936 | 0 | 0 | 0 |
| 1.586999999999936 | 0 | 0 | 0 |
| 1.587999999999936 | 0 | 0 | 0 |
| 1.588999999999936 | 0 | 0 | 0 |
| 1.589999999999936 | 0 | 0 | 0 |
| 1.590999999999936 | 0 | 0 | 0 |
| 1.591999999999935 | 0 | 0 | 0 |
| 1.592999999999935 | 0 | 0 | 0 |
| 1.593999999999935 | 0 | 0 | 0 |
| 1.594999999999935 | 0 | 0 | 0 |
| 1.595999999999935 | 0 | 0 | 0 |
| 1.596999999999935 | 0 | 0 | 0 |
| 1.597999999999935 | 0 | 0 | 0 |
| 1.598999999999935 | 0 | 0 | 0 |
| 1.599999999999935 | 0 | 0 | 0 |
| 1.600999999999934 | 0 | 0 | 0 |
| 1.601999999999934 | 0 | 0 | 0 |
| 1.602999999999934 | 0 | 0 | 0 |
| 1.603999999999934 | 0 | 0 | 0 |
| 1.604999999999934 | 0 | 0 | 0 |
| 1.605999999999934 | 0 | 0 | 0 |
| 1.606999999999934 | 0 | 0 | 0 |
| 1.607999999999934 | 0 | 0 | 0 |
| 1.608999999999934 | 0 | 0 | 0 |
| 1.609999999999933 | 0 | 0 | 0 |
| 1.610999999999933 | 0 | 0 | 0 |
| 1.611999999999933 | 0 | 0 | 0 |
| 1.612999999999933 | 0 | 0 | 0 |
| 1.613999999999933 | 0 | 0 | 0 |
| 1.614999999999933 | 0 | 0 | 0 |
| 1.615999999999933 | 0 | 0 | 0 |
| 1.616999999999933 | 0 | 0 | 0 |
| 1.617999999999933 | 0 | 0 | 0 |
| 1.618999999999932 | 0 | 0 | 0 |
| 1.619999999999932 | 0 | 0 | 0 |
| 1.620999999999932 | 0 | 0 | 0 |
| 1.621999999999932 | 0 | 0 | 0 |
| 1.622999999999932 | 0 | 0 | 0 |
| 1.623999999999932 | 0 | 0 | 0 |
| 1.624999999999932 | 0 | 0 | 0 |
| 1.625999999999932 | 0 | 0 | 0 |
| 1.626999999999932 | 0 | 0 | 0 |
| 1.627999999999931 | 0 | 0 | 0 |
| 1.628999999999931 | 0 | 0 | 0 |
| 1.629999999999931 | 0 | 0 | 0 |
| 1.630999999999931 | 0 | 0 | 0 |
| 1.631999999999931 | 0 | 0 | 0 |
| 1.632999999999931 | 0 | 0 | 0 |
| 1.633999999999931 | 0 | 0 | 0 |
| 1.634999999999931 | 0 | 0 | 0 |
| 1.635999999999931 | 0 | 0 | 0 |
| 1.63699999999993 | 0 | 0 | 0 |
| 1.63799999999993 | 0 | 0 | 0 |
| 1.63899999999993 | 0 | 0 | 0 |
| 1.63999999999993 | 0 | 0 | 0 |
| 1.64099999999993 | 0 | 0 | 0 |
| 1.64199999999993 | 0 | 0 | 0 |
| 1.64299999999993 | 0 | 0 | 0 |
| 1.64399999999993 | 0 | 0 | 0 |
| 1.64499999999993 | 0 | 0 | 0 |
| 1.645999999999929 | 0 | 0 | 0 |
| 1.646999999999929 | 0 | 0 | 0 |
| 1.647999999999929 | 0 | 0 | 0 |
| 1.648999999999929 | 0 | 0 | 0 |
| 1.649999999999929 | 0 | 0 | 0 |
| 1.650999999999929 | 0 | 0 | 0 |
| 1.651999999999929 | 0 | 0 | 0 |
| 1.652999999999929 | 0 | 0 | 0 |
| 1.653999999999929 | 0 | 0 | 0 |
| 1.654999999999928 | 0 | 0 | 0 |
| 1.655999999999928 | 0 | 0 | 0 |
| 1.656999999999928 | 0 | 0 | 0 |
| 1.657999999999928 | 0 | 0 | 0 |
| 1.658999999999928 | 0 | 0 | 0 |
| 1.659999999999928 | 0 | 0 | 0 |
| 1.660999999999928 | 0 | 0 | 0 |
| 1.661999999999928 | 0 | 0 | 0 |
| 1.662999999999928 | 0 | 0 | 0 |
| 1.663999999999927 | 0 | 0 | 0 |
| 1.664999999999927 | 0 | 0 | 0 |
| 1.665999999999927 | 0 | 0 | 0 |
| 1.666999999999927 | 0 | 0 | 0 |
| 1.667999999999927 | 0 | 0 | 0 |
| 1.668999999999927 | 0 | 0 | 0 |
| 1.669999999999927 | 0 | 0 | 0 |
| 1.670999999999927 | 0 | 0 | 0 |
| 1.671999999999927 | 0 | 0 | 0 |
| 1.672999999999926 | 0 | 0 | 0 |
| 1.673999999999926 | 0 | 0 | 0 |
| 1.674999999999926 | 0 | 0 | 0 |
| 1.675999999999926 | 0 | 0 | 0 |
| 1.676999999999926 | 0 | 0 | 0 |
| 1.677999999999926 | 0 | 0 | 0 |
| 1.678999999999926 | 0 | 0 | 0 |
| 1.679999999999926 | 0 | 0 | 0 |
| 1.680999999999926 | 0 | 0 | 0 |
| 1.681999999999925 | 0 | 0 | 0 |
| 1.682999999999925 | 0 | 0 | 0 |
| 1.683999999999925 | 0 | 0 | 0 |
| 1.684999999999925 | 0 | 0 | 0 |
| 1.685999999999925 | 0 | 0 | 0 |
| 1.686999999999925 | 0 | 0 | 0 |
| 1.687999999999925 | 0 | 0 | 0 |
| 1.688999999999925 | 0 | 0 | 0 |
| 1.689999999999925 | 0 | 0 | 0 |
| 1.690999999999924 | 0 | 0 | 0 |
| 1.691999999999924 | 0 | 0 | 0 |
| 1.692999999999924 | 0 | 0 | 0 |
| 1.693999999999924 | 0 | 0 | 0 |
| 1.694999999999924 | 0 | 0 | 0 |
| 1.695999999999924 | 0 | 0 | 0 |
| 1.696999999999924 | 0 | 0 | 0 |
| 1.697999999999924 | 0 | 0 | 0 |
| 1.698999999999924 | 0 | 0 | 0 |
| 1.699999999999923 | 0 | 0 | 0 |
| 1.700999999999923 | 0 | 0 | 0 |
| 1.701999999999923 | 0 | 0 | 0 |
| 1.702999999999923 | 0 | 0 | 0 |
| 1.703999999999923 | 0 | 0 | 0 |
| 1.704999999999923 | 0 | 0 | 0 |
| 1.705999999999923 | 0 | 0 | 0 |
| 1.706999999999923 | 0 | 0 | 0 |
| 1.707999999999923 | 0 | 0 | 0 |
| 1.708999999999923 | 0 | 0 | 0 |
| 1.709999999999922 | 0 | 0 | 0 |
| 1.710999999999922 | 0 | 0 | 0 |
| 1.711999999999922 | 0 | 0 | 0 |
| 1.712999999999922 | 0 | 0 | 0 |
| 1.713999999999922 | 0 | 0 | 0 |
| 1.714999999999922 | 0 | 0 | 0 |
| 1.715999999999922 | 0 | 0 | 0 |
| 1.716999999999922 | 0 | 0 | 0 |
| 1.717999999999922 | 0 | 0 | 0 |
| 1.718999999999921 | 0 | 0 | 0 |
| 1.719999999999921 | 0 | 0 | 0 |
| 1.720999999999921 | 0 | 0 | 0 |
| 1.721999999999921 | 0 | 0 | 0 |
| 1.722999999999921 | 0 | 0 | 0 |
| 1.723999999999921 | 0 | 0 | 0 |
| 1.724999999999921 | 0 | 0 | 0 |
| 1.725999999999921 | 0 | 0 | 0 |
| 1.726999999999921 | 0 | 0 | 0 |
| 1.72799999999992 | 0 | 0 | 0 |
| 1.72899999999992 | 0 | 0 | 0 |
| 1.72999999999992 | 0 | 0 | 0 |
| 1.73099999999992 | 0 | 0 | 0 |
| 1.73199999999992 | 0 | 0 | 0 |
| 1.73299999999992 | 0 | 0 | 0 |
| 1.73399999999992 | 0 | 0 | 0 |
| 1.73499999999992 | 0 | 0 | 0 |
| 1.73599999999992 | 0 | 0 | 0 |
| 1.736999999999919 | 0 | 0 | 0 |
| 1.737999999999919 | 0 | 0 | 0 |
| 1.738999999999919 | 0 | 0 | 0 |
| 1.739999999999919 | 0 | 0 | 0 |
| 1.740999999999919 | 0 | 0 | 0 |
| 1.741999999999919 | 0 | 0 | 0 |
| 1.742999999999919 | 0 | 0 | 0 |
| 1.743999999999919 | 0 | 0 | 0 |
| 1.744999999999919 | 0 | 0 | 0 |
| 1.745999999999918 | 0 | 0 | 0 |
| 1.746999999999918 | 0 | 0 | 0 |
| 1.747999999999918 | 0 | 0 | 0 |
| 1.748999999999918 | 0 | 0 | 0 |
| 1.749999999999918 | 0 | 0 | 0 |
| 1.750999999999918 | 0 | 0 | 0 |
| 1.751999999999918 | 0 | 0 | 0 |
| 1.752999999999918 | 0 | 0 | 0 |
| 1.753999999999918 | 0 | 0 | 0 |
| 1.754999999999917 | 0 | 0 | 0 |
| 1.755999999999917 | 0 | 0 | 0 |
| 1.756999999999917 | 0 | 0 | 0 |
| 1.757999999999917 | 0 | 0 | 0 |
| 1.758999999999917 | 0 | 0 | 0 |
| 1.759999999999917 | 0 | 0 | 0 |
| 1.760999999999917 | 0 | 0 | 0 |
| 1.761999999999917 | 0 | 0 | 0 |
| 1.762999999999917 | 0 | 0 | 0 |
| 1.763999999999916 | 0 | 0 | 0 |
| 1.764999999999916 | 0 | 0 | 0 |
| 1.765999999999916 | 0 | 0 | 0 |
| 1.766999999999916 | 0 | 0 | 0 |
| 1.767999999999916 | 0 | 0 | 0 |
| 1.768999999999916 | 0 | 0 | 0 |
| 1.769999999999916 | 0 | 0 | 0 |
| 1.770999999999916 | 0 | 0 | 0 |
| 1.771999999999916 | 0 | 0 | 0 |
| 1.772999999999915 | 0 | 0 | 0 |
| 1.773999999999915 | 0 | 0 | 0 |
| 1.774999999999915 | 0 | 0 | 0 |
| 1.775999999999915 | 0 | 0 | 0 |
| 1.776999999999915 | 0 | 0 | 0 |
| 1.777999999999915 | 0 | 0 | 0 |
| 1.778999999999915 | 0 | 0 | 0 |
| 1.779999999999915 | 0 | 0 | 0 |
| 1.780999999999915 | 0 | 0 | 0 |
| 1.781999999999914 | 0 | 0 | 0 |
| 1.782999999999914 | 0 | 0 | 0 |
| 1.783999999999914 | 0 | 0 | 0 |
| 1.784999999999914 | 0 | 0 | 0 |
| 1.785999999999914 | 0 | 0 | 0 |
| 1.786999999999914 | 0 | 0 | 0 |
| 1.787999999999914 | 0 | 0 | 0 |
| 1.788999999999914 | 0 | 0 | 0 |
| 1.789999999999914 | 0 | 0 | 0 |
| 1.790999999999913 | 0 | 0 | 0 |
| 1.791999999999913 | 0 | 0 | 0 |
| 1.792999999999913 | 0 | 0 | 0 |
| 1.793999999999913 | 0 | 0 | 0 |
| 1.794999999999913 | 0 | 0 | 0 |
| 1.795999999999913 | 0 | 0 | 0 |
| 1.796999999999913 | 0 | 0 | 0 |
| 1.797999999999913 | 0 | 0 | 0 |
| 1.798999999999913 | 0 | 0 | 0 |
| 1.799999999999912 | 0 | 0 | 0 |
| 1.800999999999912 | 0 | 0 | 0 |
| 1.801999999999912 | 0 | 0 | 0 |
| 1.802999999999912 | 0 | 0 | 0 |
| 1.803999999999912 | 0 | 0 | 0 |
| 1.804999999999912 | 0 | 0 | 0 |
| 1.805999999999912 | 0 | 0 | 0 |
| 1.806999999999912 | 0 | 0 | 0 |
| 1.807999999999912 | 0 | 0 | 0 |
| 1.808999999999912 | 0 | 0 | 0 |
| 1.809999999999911 | 0 | 0 | 0 |
| 1.810999999999911 | 0 | 0 | 0 |
| 1.811999999999911 | 0 | 0 | 0 |
| 1.812999999999911 | 0 | 0 | 0 |
| 1.813999999999911 | 0 | 0 | 0 |
| 1.814999999999911 | 0 | 0 | 0 |
| 1.815999999999911 | 0 | 0 | 0 |
| 1.816999999999911 | 0 | 0 | 0 |
| 1.817999999999911 | 0 | 0 | 0 |
| 1.81899999999991 | 0 | 0 | 0 |
| 1.81999999999991 | 0 | 0 | 0 |
| 1.82099999999991 | 0 | 0 | 0 |
| 1.82199999999991 | 0 | 0 | 0 |
| 1.82299999999991 | 0 | 0 | 0 |
| 1.82399999999991 | 0 | 0 | 0 |
| 1.82499999999991 | 0 | 0 | 0 |
| 1.82599999999991 | 0 | 0 | 0 |
| 1.82699999999991 | 0 | 0 | 0 |
| 1.827999999999909 | 0 | 0 | 0 |
| 1.828999999999909 | 0 | 0 | 0 |
| 1.829999999999909 | 0 | 0 | 0 |
| 1.830999999999909 | 0 | 0 | 0 |
| 1.831999999999909 | 0 | 0 | 0 |
| 1.832999999999909 | 0 | 0 | 0 |
| 1.833999999999909 | 0 | 0 | 0 |
| 1.834999999999909 | 0 | 0 | 0 |
| 1.835999999999909 | 0 | 0 | 0 |
| 1.836999999999908 | 0 | 0 | 0 |
| 1.837999999999908 | 0 | 0 | 0 |
| 1.838999999999908 | 0 | 0 | 0 |
| 1.839999999999908 | 0 | 0 | 0 |
| 1.840999999999908 | 0 | 0 | 0 |
| 1.841999999999908 | 0 | 0 | 0 |
| 1.842999999999908 | 0 | 0 | 0 |
| 1.843999999999908 | 0 | 0 | 0 |
| 1.844999999999908 | 0 | 0 | 0 |
| 1.845999999999907 | 0 | 0 | 0 |
| 1.846999999999907 | 0 | 0 | 0 |
| 1.847999999999907 | 0 | 0 | 0 |
| 1.848999999999907 | 0 | 0 | 0 |
| 1.849999999999907 | 0 | 0 | 0 |
| 1.850999999999907 | 0 | 0 | 0 |
| 1.851999999999907 | 0 | 0 | 0 |
| 1.852999999999907 | 0 | 0 | 0 |
| 1.853999999999907 | 0 | 0 | 0 |
| 1.854999999999906 | 0 | 0 | 0 |
| 1.855999999999906 | 0 | 0 | 0 |
| 1.856999999999906 | 0 | 0 | 0 |
| 1.857999999999906 | 0 | 0 | 0 |
| 1.858999999999906 | 0 | 0 | 0 |
| 1.859999999999906 | 0 | 0 | 0 |
| 1.860999999999906 | 0 | 0 | 0 |
| 1.861999999999906 | 0 | 0 | 0 |
| 1.862999999999906 | 0 | 0 | 0 |
| 1.863999999999905 | 0 | 0 | 0 |
| 1.864999999999905 | 0 | 0 | 0 |
| 1.865999999999905 | 0 | 0 | 0 |
| 1.866999999999905 | 0 | 0 | 0 |
| 1.867999999999905 | 0 | 0 | 0 |
| 1.868999999999905 | 0 | 0 | 0 |
| 1.869999999999905 | 0 | 0 | 0 |
| 1.870999999999905 | 0 | 0 | 0 |
| 1.871999999999905 | 0 | 0 | 0 |
| 1.872999999999904 | 0 | 0 | 0 |
| 1.873999999999904 | 0 | 0 | 0 |
| 1.874999999999904 | 0 | 0 | 0 |
| 1.875999999999904 | 0 | 0 | 0 |
| 1.876999999999904 | 0 | 0 | 0 |
| 1.877999999999904 | 0 | 0 | 0 |
| 1.878999999999904 | 0 | 0 | 0 |
| 1.879999999999904 | 0 | 0 | 0 |
| 1.880999999999904 | 0 | 0 | 0 |
| 1.881999999999903 | 0 | 0 | 0 |
| 1.882999999999903 | 0 | 0 | 0 |
| 1.883999999999903 | 0 | 0 | 0 |
| 1.884999999999903 | 0 | 0 | 0 |
| 1.885999999999903 | 0 | 0 | 0 |
| 1.886999999999903 | 0 | 0 | 0 |
| 1.887999999999903 | 0 | 0 | 0 |
| 1.888999999999903 | 0 | 0 | 0 |
| 1.889999999999903 | 0 | 0 | 0 |
| 1.890999999999902 | 0 | 0 | 0 |
| 1.891999999999902 | 0 | 0 | 0 |
| 1.892999999999902 | 0 | 0 | 0 |
| 1.893999999999902 | 0 | 0 | 0 |
| 1.894999999999902 | 0 | 0 | 0 |
| 1.895999999999902 | 0 | 0 | 0 |
| 1.896999999999902 | 0 | 0 | 0 |
| 1.897999999999902 | 0 | 0 | 0 |
| 1.898999999999902 | 0 | 0 | 0 |
| 1.899999999999901 | 0 | 0 | 0 |
| 1.900999999999901 | 0 | 0 | 0 |
| 1.901999999999901 | 0 | 0 | 0 |
| 1.902999999999901 | 0 | 0 | 0 |
| 1.903999999999901 | 0 | 0 | 0 |
| 1.904999999999901 | 0 | 0 | 0 |
| 1.905999999999901 | 0 | 0 | 0 |
| 1.906999999999901 | 0 | 0 | 0 |
| 1.907999999999901 | 0 | 0 | 0 |
| 1.908999999999901 | 0 | 0 | 0 |
| 1.9099999999999 | 0 | 0 | 0 |
| 1.9109999999999 | 0 | 0 | 0 |
| 1.9119999999999 | 0 | 0 | 0 |
| 1.9129999999999 | 0 | 0 | 0 |
| 1.9139999999999 | 0 | 0 | 0 |
| 1.9149999999999 | 0 | 0 | 0 |
| 1.9159999999999 | 0 | 0 | 0 |
| 1.9169999999999 | 0 | 0 | 0 |
| 1.9179999999999 | 0 | 0 | 0 |
| 1.918999999999899 | 0 | 0 | 0 |
| 1.919999999999899 | 0 | 0 | 0 |
| 1.920999999999899 | 0 | 0 | 0 |
| 1.921999999999899 | 0 | 0 | 0 |
| 1.922999999999899 | 0 | 0 | 0 |
| 1.923999999999899 | 0 | 0 | 0 |
| 1.924999999999899 | 0 | 0 | 0 |
| 1.925999999999899 | 0 | 0 | 0 |
| 1.926999999999899 | 0 | 0 | 0 |
| 1.927999999999898 | 0 | 0 | 0 |
| 1.928999999999898 | 0 | 0 | 0 |
| 1.929999999999898 | 0 | 0 | 0 |
| 1.930999999999898 | 0 | 0 | 0 |
| 1.931999999999898 | 0 | 0 | 0 |
| 1.932999999999898 | 0 | 0 | 0 |
| 1.933999999999898 | 0 | 0 | 0 |
| 1.934999999999898 | 0 | 0 | 0 |
| 1.935999999999898 | 0 | 0 | 0 |
| 1.936999999999897 | 0 | 0 | 0 |
| 1.937999999999897 | 0 | 0 | 0 |
| 1.938999999999897 | 0 | 0 | 0 |
| 1.939999999999897 | 0 | 0 | 0 |
| 1.940999999999897 | 0 | 0 | 0 |
| 1.941999999999897 | 0 | 0 | 0 |
| 1.942999999999897 | 0 | 0 | 0 |
| 1.943999999999897 | 0 | 0 | 0 |
| 1.944999999999897 | 0 | 0 | 0 |
| 1.945999999999896 | 0 | 0 | 0 |
| 1.946999999999896 | 0 | 0 | 0 |
| 1.947999999999896 | 0 | 0 | 0 |
| 1.948999999999896 | 0 | 0 | 0 |
| 1.949999999999896 | 0 | 0 | 0 |
| 1.950999999999896 | 0 | 0 | 0 |
| 1.951999999999896 | 0 | 0 | 0 |
| 1.952999999999896 | 0 | 0 | 0 |
| 1.953999999999896 | 0 | 0 | 0 |
| 1.954999999999895 | 0 | 0 | 0 |
| 1.955999999999895 | 0 | 0 | 0 |
| 1.956999999999895 | 0 | 0 | 0 |
| 1.957999999999895 | 0 | 0 | 0 |
| 1.958999999999895 | 0 | 0 | 0 |
| 1.959999999999895 | 0 | 0 | 0 |
| 1.960999999999895 | 0 | 0 | 0 |
| 1.961999999999895 | 0 | 0 | 0 |
| 1.962999999999895 | 0 | 0 | 0 |
| 1.963999999999894 | 0 | 0 | 0 |
| 1.964999999999894 | 0 | 0 | 0 |
| 1.965999999999894 | 0 | 0 | 0 |
| 1.966999999999894 | 0 | 0 | 0 |
| 1.967999999999894 | 0 | 0 | 0 |
| 1.968999999999894 | 0 | 0 | 0 |
| 1.969999999999894 | 0 | 0 | 0 |
| 1.970999999999894 | 0 | 0 | 0 |
| 1.971999999999894 | 0 | 0 | 0 |
| 1.972999999999893 | 0 | 0 | 0 |
| 1.973999999999893 | 0 | 0 | 0 |
| 1.974999999999893 | 0 | 0 | 0 |
| 1.975999999999893 | 0 | 0 | 0 |
| 1.976999999999893 | 0 | 0 | 0 |
| 1.977999999999893 | 0 | 0 | 0 |
| 1.978999999999893 | 0 | 0 | 0 |
| 1.979999999999893 | 0 | 0 | 0 |
| 1.980999999999893 | 0 | 0 | 0 |
| 1.981999999999892 | 0 | 0 | 0 |
| 1.982999999999892 | 0 | 0 | 0 |
| 1.983999999999892 | 0 | 0 | 0 |
| 1.984999999999892 | 0 | 0 | 0 |
| 1.985999999999892 | 0 | 0 | 0 |
| 1.986999999999892 | 0 | 0 | 0 |
| 1.987999999999892 | 0 | 0 | 0 |
| 1.988999999999892 | 0 | 0 | 0 |
| 1.989999999999892 | 0 | 0 | 0 |
| 1.990999999999891 | 0 | 0 | 0 |
| 1.991999999999891 | 0 | 0 | 0 |
| 1.992999999999891 | 0 | 0 | 0 |
| 1.993999999999891 | 0 | 0 | 0 |
| 1.994999999999891 | 0 | 0 | 0 |
| 1.995999999999891 | 0 | 0 | 0 |
| 1.996999999999891 | 0 | 0 | 0 |
| 1.997999999999891 | 0 | 0 | 0 |
| 1.998999999999891 | 0 | 0 | 0 |
| 1.99999999999989 | 0 | 0 | 0 |